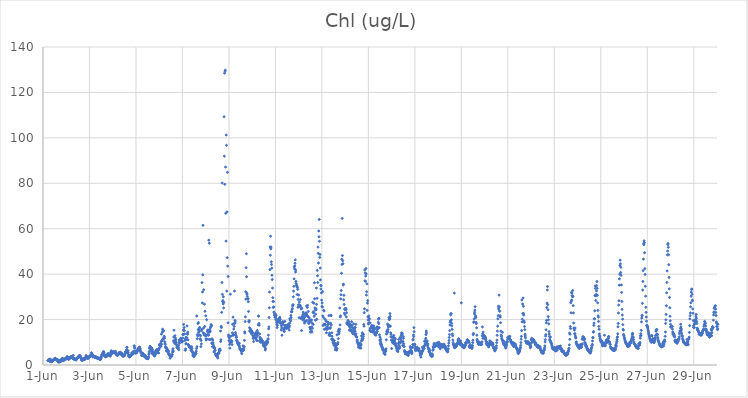
| Category | Chl (ug/L) |
|---|---|
| 44348.208333333336 | 1.96 |
| 44348.21875 | 1.93 |
| 44348.229166666664 | 2.07 |
| 44348.239583333336 | 1.94 |
| 44348.25 | 1.93 |
| 44348.260416666664 | 2.61 |
| 44348.270833333336 | 1.78 |
| 44348.28125 | 1.86 |
| 44348.291666666664 | 1.71 |
| 44348.302083333336 | 1.68 |
| 44348.3125 | 1.9 |
| 44348.322916666664 | 2.53 |
| 44348.333333333336 | 1.59 |
| 44348.34375 | 1.69 |
| 44348.354166666664 | 1.73 |
| 44348.364583333336 | 1.57 |
| 44348.375 | 1.46 |
| 44348.385416666664 | 1.53 |
| 44348.395833333336 | 1.7 |
| 44348.40625 | 1.76 |
| 44348.416666666664 | 1.79 |
| 44348.427083333336 | 1.91 |
| 44348.4375 | 2.16 |
| 44348.447916666664 | 2.2 |
| 44348.458333333336 | 2.27 |
| 44348.46875 | 2.54 |
| 44348.479166666664 | 2.6 |
| 44348.489583333336 | 2.59 |
| 44348.5 | 2.6 |
| 44348.510416666664 | 2.67 |
| 44348.520833333336 | 2.82 |
| 44348.53125 | 2.98 |
| 44348.541666666664 | 2.52 |
| 44348.552083333336 | 2.63 |
| 44348.5625 | 2.37 |
| 44348.572916666664 | 2.26 |
| 44348.583333333336 | 2.15 |
| 44348.59375 | 2.37 |
| 44348.604166666664 | 2.31 |
| 44348.614583333336 | 1.94 |
| 44348.625 | 2.42 |
| 44348.635416666664 | 1.95 |
| 44348.645833333336 | 1.94 |
| 44348.65625 | 1.31 |
| 44348.666666666664 | 1.36 |
| 44348.677083333336 | 1.84 |
| 44348.6875 | 1.83 |
| 44348.697916666664 | 1.46 |
| 44348.708333333336 | 1.4 |
| 44348.71875 | 1.34 |
| 44348.729166666664 | 2.06 |
| 44348.739583333336 | 1.53 |
| 44348.75 | 1.81 |
| 44348.760416666664 | 1.57 |
| 44348.770833333336 | 2.18 |
| 44348.78125 | 2.31 |
| 44348.791666666664 | 1.9 |
| 44348.802083333336 | 2.48 |
| 44348.8125 | 2.7 |
| 44348.822916666664 | 2.13 |
| 44348.833333333336 | 2.87 |
| 44348.84375 | 2.91 |
| 44348.854166666664 | 2.19 |
| 44348.864583333336 | 2.61 |
| 44348.875 | 2.01 |
| 44348.885416666664 | 2.13 |
| 44348.895833333336 | 2.11 |
| 44348.90625 | 2.2 |
| 44348.916666666664 | 2.36 |
| 44348.927083333336 | 2.61 |
| 44348.9375 | 2.63 |
| 44348.947916666664 | 2.58 |
| 44348.958333333336 | 2.64 |
| 44348.96875 | 2.7 |
| 44348.979166666664 | 2.63 |
| 44348.989583333336 | 2.73 |
| 44349.0 | 2.76 |
| 44349.010416666664 | 2.78 |
| 44349.020833333336 | 2.93 |
| 44349.03125 | 3.55 |
| 44349.041666666664 | 3.67 |
| 44349.052083333336 | 3.5 |
| 44349.0625 | 3.17 |
| 44349.072916666664 | 3.05 |
| 44349.083333333336 | 2.74 |
| 44349.09375 | 2.45 |
| 44349.104166666664 | 2.76 |
| 44349.114583333336 | 3.03 |
| 44349.125 | 2.93 |
| 44349.135416666664 | 2.79 |
| 44349.145833333336 | 3.24 |
| 44349.15625 | 2.96 |
| 44349.166666666664 | 3.1 |
| 44349.177083333336 | 3.44 |
| 44349.1875 | 3.38 |
| 44349.197916666664 | 3.59 |
| 44349.208333333336 | 3.63 |
| 44349.21875 | 3.52 |
| 44349.229166666664 | 3.71 |
| 44349.239583333336 | 3.4 |
| 44349.25 | 3.38 |
| 44349.260416666664 | 3.02 |
| 44349.270833333336 | 3 |
| 44349.28125 | 3.22 |
| 44349.291666666664 | 2.79 |
| 44349.302083333336 | 4.26 |
| 44349.3125 | 2.68 |
| 44349.322916666664 | 2.86 |
| 44349.333333333336 | 2.99 |
| 44349.34375 | 2.76 |
| 44349.354166666664 | 2.41 |
| 44349.364583333336 | 2.48 |
| 44349.375 | 2.34 |
| 44349.385416666664 | 2.72 |
| 44349.395833333336 | 2.37 |
| 44349.40625 | 2.35 |
| 44349.416666666664 | 2.24 |
| 44349.427083333336 | 2.26 |
| 44349.4375 | 2.51 |
| 44349.447916666664 | 2.71 |
| 44349.458333333336 | 2.89 |
| 44349.46875 | 3.06 |
| 44349.479166666664 | 3.01 |
| 44349.489583333336 | 3.19 |
| 44349.5 | 3.44 |
| 44349.510416666664 | 3.29 |
| 44349.520833333336 | 3.39 |
| 44349.53125 | 3.58 |
| 44349.541666666664 | 3.77 |
| 44349.552083333336 | 3.9 |
| 44349.5625 | 4.17 |
| 44349.572916666664 | 4 |
| 44349.583333333336 | 4.14 |
| 44349.59375 | 4.04 |
| 44349.604166666664 | 3.93 |
| 44349.614583333336 | 3.36 |
| 44349.625 | 3.32 |
| 44349.635416666664 | 2.84 |
| 44349.645833333336 | 2.73 |
| 44349.65625 | 2.26 |
| 44349.666666666664 | 2.16 |
| 44349.677083333336 | 2.01 |
| 44349.6875 | 2.41 |
| 44349.697916666664 | 2.23 |
| 44349.708333333336 | 2.37 |
| 44349.71875 | 2.66 |
| 44349.729166666664 | 2.76 |
| 44349.739583333336 | 2.3 |
| 44349.75 | 2.49 |
| 44349.760416666664 | 2.7 |
| 44349.770833333336 | 2.66 |
| 44349.78125 | 2.72 |
| 44349.791666666664 | 2.96 |
| 44349.802083333336 | 2.43 |
| 44349.8125 | 2.91 |
| 44349.822916666664 | 2.88 |
| 44349.833333333336 | 3.37 |
| 44349.84375 | 3.35 |
| 44349.854166666664 | 4.21 |
| 44349.864583333336 | 3.57 |
| 44349.875 | 3.59 |
| 44349.885416666664 | 3.69 |
| 44349.895833333336 | 2.93 |
| 44349.90625 | 3.58 |
| 44349.916666666664 | 3.06 |
| 44349.927083333336 | 3.03 |
| 44349.9375 | 3.09 |
| 44349.947916666664 | 3.05 |
| 44349.958333333336 | 3.05 |
| 44349.96875 | 3.17 |
| 44349.979166666664 | 3.39 |
| 44349.989583333336 | 3.69 |
| 44350.0 | 3.71 |
| 44350.010416666664 | 3.8 |
| 44350.020833333336 | 4.07 |
| 44350.03125 | 4.06 |
| 44350.041666666664 | 3.96 |
| 44350.052083333336 | 4.18 |
| 44350.0625 | 4.14 |
| 44350.072916666664 | 4.14 |
| 44350.083333333336 | 5.41 |
| 44350.09375 | 4.54 |
| 44350.104166666664 | 4.91 |
| 44350.114583333336 | 4.54 |
| 44350.125 | 4.47 |
| 44350.135416666664 | 3.64 |
| 44350.145833333336 | 3.72 |
| 44350.15625 | 3.63 |
| 44350.166666666664 | 3.92 |
| 44350.177083333336 | 3.7 |
| 44350.1875 | 3.74 |
| 44350.197916666664 | 3.67 |
| 44350.208333333336 | 3.82 |
| 44350.21875 | 3.5 |
| 44350.229166666664 | 3.68 |
| 44350.239583333336 | 3.21 |
| 44350.25 | 3.28 |
| 44350.260416666664 | 3.57 |
| 44350.270833333336 | 3.4 |
| 44350.28125 | 3.67 |
| 44350.291666666664 | 3.41 |
| 44350.302083333336 | 3.27 |
| 44350.3125 | 3.15 |
| 44350.322916666664 | 3.24 |
| 44350.333333333336 | 3.05 |
| 44350.34375 | 3.11 |
| 44350.354166666664 | 3.17 |
| 44350.364583333336 | 2.71 |
| 44350.375 | 2.88 |
| 44350.385416666664 | 3.12 |
| 44350.395833333336 | 2.97 |
| 44350.40625 | 2.85 |
| 44350.416666666664 | 3.01 |
| 44350.427083333336 | 2.67 |
| 44350.4375 | 2.6 |
| 44350.447916666664 | 2.59 |
| 44350.458333333336 | 2.31 |
| 44350.46875 | 2.48 |
| 44350.479166666664 | 2.53 |
| 44350.489583333336 | 2.84 |
| 44350.5 | 3.1 |
| 44350.510416666664 | 3.51 |
| 44350.520833333336 | 4.01 |
| 44350.53125 | 4.52 |
| 44350.541666666664 | 4.69 |
| 44350.552083333336 | 4.81 |
| 44350.5625 | 5 |
| 44350.572916666664 | 5.16 |
| 44350.583333333336 | 5.48 |
| 44350.59375 | 5.31 |
| 44350.604166666664 | 5.95 |
| 44350.614583333336 | 5.47 |
| 44350.625 | 5.24 |
| 44350.635416666664 | 4.62 |
| 44350.645833333336 | 4.03 |
| 44350.65625 | 4.01 |
| 44350.666666666664 | 4.13 |
| 44350.677083333336 | 3.85 |
| 44350.6875 | 3.93 |
| 44350.697916666664 | 3.64 |
| 44350.708333333336 | 3.61 |
| 44350.71875 | 3.81 |
| 44350.729166666664 | 3.77 |
| 44350.739583333336 | 3.78 |
| 44350.75 | 4.06 |
| 44350.760416666664 | 4.17 |
| 44350.770833333336 | 4.66 |
| 44350.78125 | 4.66 |
| 44350.791666666664 | 4.8 |
| 44350.802083333336 | 5.08 |
| 44350.8125 | 4.54 |
| 44350.822916666664 | 4.35 |
| 44350.833333333336 | 4.39 |
| 44350.84375 | 4.42 |
| 44350.854166666664 | 4.68 |
| 44350.864583333336 | 4.7 |
| 44350.875 | 4.72 |
| 44350.885416666664 | 3.91 |
| 44350.895833333336 | 3.98 |
| 44350.90625 | 4.31 |
| 44350.916666666664 | 5.35 |
| 44350.927083333336 | 5.79 |
| 44350.9375 | 6.26 |
| 44350.947916666664 | 5.61 |
| 44350.958333333336 | 5.1 |
| 44350.96875 | 5.19 |
| 44350.979166666664 | 5.56 |
| 44350.989583333336 | 5.3 |
| 44351.0 | 5.2 |
| 44351.010416666664 | 5.44 |
| 44351.020833333336 | 5.64 |
| 44351.03125 | 5.93 |
| 44351.041666666664 | 5.94 |
| 44351.052083333336 | 5.72 |
| 44351.0625 | 5.68 |
| 44351.072916666664 | 5.46 |
| 44351.083333333336 | 5.32 |
| 44351.09375 | 5.48 |
| 44351.104166666664 | 5.31 |
| 44351.114583333336 | 5.22 |
| 44351.125 | 5.99 |
| 44351.135416666664 | 5.33 |
| 44351.145833333336 | 5.09 |
| 44351.15625 | 4.74 |
| 44351.166666666664 | 4.41 |
| 44351.177083333336 | 4.62 |
| 44351.1875 | 4.6 |
| 44351.197916666664 | 4.38 |
| 44351.208333333336 | 4.24 |
| 44351.21875 | 4.53 |
| 44351.229166666664 | 4.64 |
| 44351.239583333336 | 4.54 |
| 44351.25 | 4.96 |
| 44351.260416666664 | 4.79 |
| 44351.270833333336 | 5.3 |
| 44351.28125 | 5.5 |
| 44351.291666666664 | 5.22 |
| 44351.302083333336 | 5.31 |
| 44351.3125 | 5.3 |
| 44351.322916666664 | 5.64 |
| 44351.333333333336 | 4.75 |
| 44351.34375 | 5.12 |
| 44351.354166666664 | 5.37 |
| 44351.364583333336 | 4.91 |
| 44351.375 | 5.22 |
| 44351.385416666664 | 5.07 |
| 44351.395833333336 | 5 |
| 44351.40625 | 4.42 |
| 44351.416666666664 | 4.59 |
| 44351.427083333336 | 3.88 |
| 44351.4375 | 4.19 |
| 44351.447916666664 | 4.09 |
| 44351.458333333336 | 3.91 |
| 44351.46875 | 4.15 |
| 44351.479166666664 | 4.01 |
| 44351.489583333336 | 4 |
| 44351.5 | 4.33 |
| 44351.510416666664 | 4.28 |
| 44351.520833333336 | 4.58 |
| 44351.53125 | 5.01 |
| 44351.541666666664 | 5.37 |
| 44351.552083333336 | 5.85 |
| 44351.5625 | 5.92 |
| 44351.572916666664 | 5.71 |
| 44351.583333333336 | 5.7 |
| 44351.59375 | 6.7 |
| 44351.604166666664 | 7.75 |
| 44351.614583333336 | 7.74 |
| 44351.625 | 6.35 |
| 44351.635416666664 | 5.32 |
| 44351.645833333336 | 5.98 |
| 44351.65625 | 6.34 |
| 44351.666666666664 | 5.44 |
| 44351.677083333336 | 4.38 |
| 44351.6875 | 3.78 |
| 44351.697916666664 | 4.44 |
| 44351.708333333336 | 3.84 |
| 44351.71875 | 3.95 |
| 44351.729166666664 | 3.48 |
| 44351.739583333336 | 3.79 |
| 44351.75 | 4.16 |
| 44351.760416666664 | 3.9 |
| 44351.770833333336 | 4.16 |
| 44351.78125 | 4.08 |
| 44351.791666666664 | 4.31 |
| 44351.802083333336 | 4.5 |
| 44351.8125 | 4.67 |
| 44351.822916666664 | 5.26 |
| 44351.833333333336 | 5.43 |
| 44351.84375 | 5.14 |
| 44351.854166666664 | 5.39 |
| 44351.864583333336 | 4.96 |
| 44351.875 | 4.87 |
| 44351.885416666664 | 5.25 |
| 44351.895833333336 | 6.04 |
| 44351.90625 | 5.61 |
| 44351.916666666664 | 5.53 |
| 44351.927083333336 | 8.5 |
| 44351.9375 | 7.85 |
| 44351.947916666664 | 7.4 |
| 44351.958333333336 | 5.22 |
| 44351.96875 | 6.16 |
| 44351.979166666664 | 5.73 |
| 44351.989583333336 | 5.84 |
| 44352.0 | 5.16 |
| 44352.010416666664 | 5.83 |
| 44352.020833333336 | 5.52 |
| 44352.03125 | 5.58 |
| 44352.041666666664 | 5.77 |
| 44352.052083333336 | 6.32 |
| 44352.0625 | 6.32 |
| 44352.072916666664 | 6.53 |
| 44352.083333333336 | 7.01 |
| 44352.09375 | 6.68 |
| 44352.104166666664 | 7.12 |
| 44352.114583333336 | 7.57 |
| 44352.125 | 7.53 |
| 44352.135416666664 | 7.09 |
| 44352.145833333336 | 7.17 |
| 44352.15625 | 6.69 |
| 44352.166666666664 | 7.91 |
| 44352.177083333336 | 6.09 |
| 44352.1875 | 7.08 |
| 44352.197916666664 | 5.91 |
| 44352.208333333336 | 5.99 |
| 44352.21875 | 5.2 |
| 44352.229166666664 | 5.28 |
| 44352.239583333336 | 4.19 |
| 44352.25 | 5.27 |
| 44352.260416666664 | 4.2 |
| 44352.270833333336 | 4.39 |
| 44352.28125 | 5.02 |
| 44352.291666666664 | 5.13 |
| 44352.302083333336 | 4.97 |
| 44352.3125 | 4.67 |
| 44352.322916666664 | 4.41 |
| 44352.333333333336 | 4.56 |
| 44352.34375 | 4.19 |
| 44352.354166666664 | 4.16 |
| 44352.364583333336 | 3.66 |
| 44352.375 | 4.28 |
| 44352.385416666664 | 3.89 |
| 44352.395833333336 | 4.27 |
| 44352.40625 | 3.9 |
| 44352.416666666664 | 3.82 |
| 44352.427083333336 | 3.13 |
| 44352.4375 | 3.17 |
| 44352.447916666664 | 2.92 |
| 44352.458333333336 | 2.9 |
| 44352.46875 | 2.93 |
| 44352.479166666664 | 3.24 |
| 44352.489583333336 | 2.98 |
| 44352.5 | 2.94 |
| 44352.510416666664 | 2.73 |
| 44352.520833333336 | 2.85 |
| 44352.53125 | 3.22 |
| 44352.541666666664 | 3.61 |
| 44352.552083333336 | 4.63 |
| 44352.5625 | 5.24 |
| 44352.572916666664 | 5.98 |
| 44352.583333333336 | 7.28 |
| 44352.59375 | 7.56 |
| 44352.604166666664 | 8.24 |
| 44352.614583333336 | 7.9 |
| 44352.625 | 7.37 |
| 44352.635416666664 | 6.02 |
| 44352.645833333336 | 7.71 |
| 44352.65625 | 7.69 |
| 44352.666666666664 | 7.44 |
| 44352.677083333336 | 6.84 |
| 44352.6875 | 5.14 |
| 44352.697916666664 | 6.43 |
| 44352.708333333336 | 6.92 |
| 44352.71875 | 5.24 |
| 44352.729166666664 | 4.98 |
| 44352.739583333336 | 5.7 |
| 44352.75 | 5.16 |
| 44352.760416666664 | 5.31 |
| 44352.770833333336 | 4.28 |
| 44352.78125 | 4.53 |
| 44352.791666666664 | 4.17 |
| 44352.802083333336 | 4.03 |
| 44352.8125 | 3.98 |
| 44352.822916666664 | 4.63 |
| 44352.833333333336 | 4.59 |
| 44352.84375 | 5.96 |
| 44352.854166666664 | 5.88 |
| 44352.864583333336 | 6.25 |
| 44352.875 | 5.33 |
| 44352.885416666664 | 6.71 |
| 44352.895833333336 | 6.78 |
| 44352.90625 | 6.37 |
| 44352.916666666664 | 6.45 |
| 44352.927083333336 | 5.43 |
| 44352.9375 | 6.61 |
| 44352.947916666664 | 6.3 |
| 44352.958333333336 | 6.37 |
| 44352.96875 | 6.64 |
| 44352.979166666664 | 5.31 |
| 44352.989583333336 | 6.99 |
| 44353.0 | 7.36 |
| 44353.010416666664 | 8.61 |
| 44353.020833333336 | 8.97 |
| 44353.03125 | 9.23 |
| 44353.041666666664 | 9.15 |
| 44353.052083333336 | 8.21 |
| 44353.0625 | 8.89 |
| 44353.072916666664 | 8.18 |
| 44353.083333333336 | 10.17 |
| 44353.09375 | 13.6 |
| 44353.104166666664 | 9.1 |
| 44353.114583333336 | 10.81 |
| 44353.125 | 10.83 |
| 44353.135416666664 | 14.45 |
| 44353.145833333336 | 15.76 |
| 44353.15625 | 11.41 |
| 44353.166666666664 | 15.26 |
| 44353.177083333336 | 15.04 |
| 44353.1875 | 15.09 |
| 44353.197916666664 | 11.75 |
| 44353.208333333336 | 12.29 |
| 44353.21875 | 12.65 |
| 44353.229166666664 | 11.74 |
| 44353.239583333336 | 10.25 |
| 44353.25 | 9.56 |
| 44353.260416666664 | 9.05 |
| 44353.270833333336 | 7.85 |
| 44353.28125 | 8.07 |
| 44353.291666666664 | 7.54 |
| 44353.302083333336 | 7.4 |
| 44353.3125 | 6.1 |
| 44353.322916666664 | 6.51 |
| 44353.333333333336 | 7.32 |
| 44353.34375 | 6.63 |
| 44353.354166666664 | 6.29 |
| 44353.364583333336 | 6.47 |
| 44353.375 | 6.27 |
| 44353.385416666664 | 5.61 |
| 44353.395833333336 | 6.08 |
| 44353.40625 | 4.9 |
| 44353.416666666664 | 4.95 |
| 44353.427083333336 | 4.58 |
| 44353.4375 | 4.46 |
| 44353.447916666664 | 4.27 |
| 44353.458333333336 | 3.93 |
| 44353.46875 | 2.96 |
| 44353.479166666664 | 4.01 |
| 44353.489583333336 | 4.42 |
| 44353.5 | 3.92 |
| 44353.510416666664 | 3.98 |
| 44353.520833333336 | 4.22 |
| 44353.53125 | 3.95 |
| 44353.541666666664 | 3.86 |
| 44353.552083333336 | 4.42 |
| 44353.5625 | 4.65 |
| 44353.572916666664 | 5.69 |
| 44353.583333333336 | 6.56 |
| 44353.59375 | 7.14 |
| 44353.604166666664 | 6.06 |
| 44353.614583333336 | 10.66 |
| 44353.625 | 12.36 |
| 44353.635416666664 | 15.32 |
| 44353.645833333336 | 9.88 |
| 44353.65625 | 10.62 |
| 44353.666666666664 | 10.09 |
| 44353.677083333336 | 12.93 |
| 44353.6875 | 9.39 |
| 44353.697916666664 | 11.87 |
| 44353.708333333336 | 11.12 |
| 44353.71875 | 10.95 |
| 44353.729166666664 | 9.93 |
| 44353.739583333336 | 9.15 |
| 44353.75 | 8.84 |
| 44353.760416666664 | 7.65 |
| 44353.770833333336 | 7.99 |
| 44353.78125 | 7.6 |
| 44353.791666666664 | 7.84 |
| 44353.802083333336 | 7.42 |
| 44353.8125 | 7.22 |
| 44353.822916666664 | 7.72 |
| 44353.833333333336 | 8.54 |
| 44353.84375 | 6.7 |
| 44353.854166666664 | 10.08 |
| 44353.864583333336 | 11.02 |
| 44353.875 | 9.54 |
| 44353.885416666664 | 11.03 |
| 44353.895833333336 | 11.11 |
| 44353.90625 | 10.76 |
| 44353.916666666664 | 11.31 |
| 44353.927083333336 | 11.75 |
| 44353.9375 | 10.98 |
| 44353.947916666664 | 11 |
| 44353.958333333336 | 10.75 |
| 44353.96875 | 10.23 |
| 44353.979166666664 | 10.39 |
| 44353.989583333336 | 10.14 |
| 44354.0 | 10.5 |
| 44354.010416666664 | 11.89 |
| 44354.020833333336 | 13.34 |
| 44354.03125 | 13.53 |
| 44354.041666666664 | 15.3 |
| 44354.052083333336 | 17.88 |
| 44354.0625 | 15.37 |
| 44354.072916666664 | 16.48 |
| 44354.083333333336 | 15.15 |
| 44354.09375 | 13.65 |
| 44354.104166666664 | 10.79 |
| 44354.114583333336 | 11.48 |
| 44354.125 | 6.45 |
| 44354.135416666664 | 7.11 |
| 44354.145833333336 | 9.27 |
| 44354.15625 | 12.21 |
| 44354.166666666664 | 9.44 |
| 44354.177083333336 | 11.18 |
| 44354.1875 | 11.99 |
| 44354.197916666664 | 17.19 |
| 44354.208333333336 | 13.83 |
| 44354.21875 | 13.51 |
| 44354.229166666664 | 14.5 |
| 44354.239583333336 | 11.08 |
| 44354.25 | 9 |
| 44354.260416666664 | 8.59 |
| 44354.270833333336 | 8.56 |
| 44354.28125 | 8.35 |
| 44354.291666666664 | 7.88 |
| 44354.302083333336 | 7.96 |
| 44354.3125 | 7.89 |
| 44354.322916666664 | 8.1 |
| 44354.333333333336 | 7.87 |
| 44354.34375 | 7.71 |
| 44354.354166666664 | 7.57 |
| 44354.364583333336 | 6.39 |
| 44354.375 | 6.97 |
| 44354.385416666664 | 7.67 |
| 44354.395833333336 | 8.05 |
| 44354.40625 | 7.26 |
| 44354.416666666664 | 6.11 |
| 44354.427083333336 | 5.79 |
| 44354.4375 | 5.33 |
| 44354.447916666664 | 4.12 |
| 44354.458333333336 | 4.4 |
| 44354.46875 | 5.29 |
| 44354.479166666664 | 4.32 |
| 44354.489583333336 | 3.67 |
| 44354.5 | 4.55 |
| 44354.510416666664 | 4.35 |
| 44354.520833333336 | 4.4 |
| 44354.53125 | 4.34 |
| 44354.541666666664 | 4.41 |
| 44354.552083333336 | 5.13 |
| 44354.5625 | 5.5 |
| 44354.572916666664 | 4.91 |
| 44354.583333333336 | 5.06 |
| 44354.59375 | 6.1 |
| 44354.604166666664 | 7.25 |
| 44354.614583333336 | 21.59 |
| 44354.625 | 8.06 |
| 44354.635416666664 | 11.58 |
| 44354.645833333336 | 13.39 |
| 44354.65625 | 12.81 |
| 44354.666666666664 | 18.28 |
| 44354.677083333336 | 15.6 |
| 44354.6875 | 18.68 |
| 44354.697916666664 | 14.32 |
| 44354.708333333336 | 15.42 |
| 44354.71875 | 14.81 |
| 44354.729166666664 | 16.14 |
| 44354.739583333336 | 16.55 |
| 44354.75 | 13.22 |
| 44354.760416666664 | 11.57 |
| 44354.770833333336 | 11.32 |
| 44354.78125 | 12.88 |
| 44354.791666666664 | 8.1 |
| 44354.802083333336 | 10.8 |
| 44354.8125 | 9.31 |
| 44354.822916666664 | 15.08 |
| 44354.833333333336 | 15.69 |
| 44354.84375 | 36.27 |
| 44354.854166666664 | 27.34 |
| 44354.864583333336 | 32.16 |
| 44354.875 | 39.71 |
| 44354.885416666664 | 61.5 |
| 44354.895833333336 | 14.14 |
| 44354.90625 | 16.23 |
| 44354.916666666664 | 33.12 |
| 44354.927083333336 | 13.27 |
| 44354.9375 | 13.74 |
| 44354.947916666664 | 26.77 |
| 44354.958333333336 | 16.96 |
| 44354.96875 | 23.63 |
| 44354.979166666664 | 13.43 |
| 44354.989583333336 | 12.82 |
| 44355.0 | 21.69 |
| 44355.010416666664 | 11.49 |
| 44355.020833333336 | 11 |
| 44355.03125 | 12.95 |
| 44355.041666666664 | 19.94 |
| 44355.052083333336 | 11.5 |
| 44355.0625 | 13.32 |
| 44355.072916666664 | 14.77 |
| 44355.083333333336 | 15.39 |
| 44355.09375 | 14.66 |
| 44355.104166666664 | 14.66 |
| 44355.114583333336 | 13.58 |
| 44355.125 | 13.08 |
| 44355.135416666664 | 54.95 |
| 44355.145833333336 | 11.25 |
| 44355.15625 | 53.6 |
| 44355.166666666664 | 15.66 |
| 44355.177083333336 | 14.48 |
| 44355.1875 | 11.21 |
| 44355.197916666664 | 14.97 |
| 44355.208333333336 | 16.46 |
| 44355.21875 | 16.8 |
| 44355.229166666664 | 17.7 |
| 44355.239583333336 | 17.56 |
| 44355.25 | 17.32 |
| 44355.260416666664 | 9.7 |
| 44355.270833333336 | 11.56 |
| 44355.28125 | 9.43 |
| 44355.291666666664 | 8.04 |
| 44355.302083333336 | 10.99 |
| 44355.3125 | 9.85 |
| 44355.322916666664 | 9.18 |
| 44355.333333333336 | 8.19 |
| 44355.34375 | 8.19 |
| 44355.354166666664 | 5.75 |
| 44355.364583333336 | 7.46 |
| 44355.375 | 7.37 |
| 44355.385416666664 | 7.52 |
| 44355.395833333336 | 6.29 |
| 44355.40625 | 6.53 |
| 44355.416666666664 | 4.75 |
| 44355.427083333336 | 4.77 |
| 44355.4375 | 4.84 |
| 44355.447916666664 | 4.23 |
| 44355.458333333336 | 4.16 |
| 44355.46875 | 3.94 |
| 44355.479166666664 | 4.29 |
| 44355.489583333336 | 3.77 |
| 44355.5 | 4.47 |
| 44355.510416666664 | 3.68 |
| 44355.520833333336 | 3.05 |
| 44355.53125 | 4.99 |
| 44355.541666666664 | 4.9 |
| 44355.552083333336 | 5.48 |
| 44355.5625 | 5.32 |
| 44355.572916666664 | 5.21 |
| 44355.583333333336 | 6.68 |
| 44355.59375 | 6.77 |
| 44355.604166666664 | 6.32 |
| 44355.614583333336 | 7.07 |
| 44355.625 | 6.56 |
| 44355.635416666664 | 14.96 |
| 44355.645833333336 | 10.34 |
| 44355.65625 | 11.08 |
| 44355.666666666664 | 17.05 |
| 44355.677083333336 | 16.5 |
| 44355.6875 | 23.15 |
| 44355.697916666664 | 36.33 |
| 44355.708333333336 | 80.13 |
| 44355.71875 | 31.11 |
| 44355.729166666664 | 27.95 |
| 44355.739583333336 | 28.38 |
| 44355.75 | 26.87 |
| 44355.760416666664 | 30.04 |
| 44355.770833333336 | 25.13 |
| 44355.78125 | 27.57 |
| 44355.791666666664 | 109.29 |
| 44355.802083333336 | 91.94 |
| 44355.8125 | 128.48 |
| 44355.822916666664 | 79.55 |
| 44355.833333333336 | 129.35 |
| 44355.84375 | 129.81 |
| 44355.854166666664 | 87.15 |
| 44355.864583333336 | 66.81 |
| 44355.875 | 54.55 |
| 44355.885416666664 | 101.24 |
| 44355.895833333336 | 96.7 |
| 44355.90625 | 32.55 |
| 44355.916666666664 | 67.43 |
| 44355.927083333336 | 47.25 |
| 44355.9375 | 84.81 |
| 44355.947916666664 | 43.52 |
| 44355.958333333336 | 18.57 |
| 44355.96875 | 38.96 |
| 44355.979166666664 | 13.18 |
| 44355.989583333336 | 12.4 |
| 44356.0 | 10.77 |
| 44356.010416666664 | 12.67 |
| 44356.020833333336 | 11.92 |
| 44356.03125 | 9.04 |
| 44356.041666666664 | 7.42 |
| 44356.052083333336 | 9.8 |
| 44356.0625 | 31.16 |
| 44356.072916666664 | 10.15 |
| 44356.083333333336 | 12.68 |
| 44356.09375 | 10.77 |
| 44356.104166666664 | 10.67 |
| 44356.114583333336 | 10.33 |
| 44356.125 | 10.28 |
| 44356.135416666664 | 9.03 |
| 44356.145833333336 | 14.19 |
| 44356.15625 | 17.88 |
| 44356.166666666664 | 13.08 |
| 44356.177083333336 | 21.05 |
| 44356.1875 | 13.49 |
| 44356.197916666664 | 13.15 |
| 44356.208333333336 | 15.84 |
| 44356.21875 | 18.22 |
| 44356.229166666664 | 16.97 |
| 44356.239583333336 | 32.53 |
| 44356.25 | 18.34 |
| 44356.260416666664 | 19.62 |
| 44356.270833333336 | 18.94 |
| 44356.28125 | 14.32 |
| 44356.291666666664 | 13.53 |
| 44356.302083333336 | 13.08 |
| 44356.3125 | 12.15 |
| 44356.322916666664 | 12.28 |
| 44356.333333333336 | 10.85 |
| 44356.34375 | 10.94 |
| 44356.354166666664 | 10.49 |
| 44356.364583333336 | 10.05 |
| 44356.375 | 9.69 |
| 44356.385416666664 | 9.32 |
| 44356.395833333336 | 9.53 |
| 44356.40625 | 9.12 |
| 44356.416666666664 | 9.31 |
| 44356.427083333336 | 8.79 |
| 44356.4375 | 8.6 |
| 44356.447916666664 | 9.57 |
| 44356.458333333336 | 7.91 |
| 44356.46875 | 7.34 |
| 44356.479166666664 | 6.94 |
| 44356.489583333336 | 7.14 |
| 44356.5 | 6.98 |
| 44356.510416666664 | 6.92 |
| 44356.520833333336 | 6.21 |
| 44356.53125 | 6.46 |
| 44356.541666666664 | 5.83 |
| 44356.552083333336 | 4.99 |
| 44356.5625 | 6.92 |
| 44356.572916666664 | 6.28 |
| 44356.583333333336 | 6.53 |
| 44356.59375 | 6.36 |
| 44356.604166666664 | 8.44 |
| 44356.614583333336 | 6.74 |
| 44356.625 | 6.52 |
| 44356.635416666664 | 6.69 |
| 44356.645833333336 | 7.52 |
| 44356.65625 | 8.08 |
| 44356.666666666664 | 10.84 |
| 44356.677083333336 | 14.58 |
| 44356.6875 | 14.06 |
| 44356.697916666664 | 19.11 |
| 44356.708333333336 | 21.2 |
| 44356.71875 | 32.26 |
| 44356.729166666664 | 28.99 |
| 44356.739583333336 | 42.82 |
| 44356.75 | 48.98 |
| 44356.760416666664 | 38.86 |
| 44356.770833333336 | 31.68 |
| 44356.78125 | 31.09 |
| 44356.791666666664 | 30.18 |
| 44356.802083333336 | 29.16 |
| 44356.8125 | 29.17 |
| 44356.822916666664 | 29.06 |
| 44356.833333333336 | 27.87 |
| 44356.84375 | 23.58 |
| 44356.854166666664 | 19.22 |
| 44356.864583333336 | 18.91 |
| 44356.875 | 19.54 |
| 44356.885416666664 | 16.43 |
| 44356.895833333336 | 15.07 |
| 44356.90625 | 14.79 |
| 44356.916666666664 | 15.88 |
| 44356.927083333336 | 14.99 |
| 44356.9375 | 15.57 |
| 44356.947916666664 | 14.49 |
| 44356.958333333336 | 14.81 |
| 44356.96875 | 13.76 |
| 44356.979166666664 | 14.98 |
| 44356.989583333336 | 14.51 |
| 44357.0 | 14.49 |
| 44357.010416666664 | 14.33 |
| 44357.020833333336 | 13.94 |
| 44357.03125 | 12.92 |
| 44357.041666666664 | 11.88 |
| 44357.052083333336 | 11.67 |
| 44357.0625 | 10.35 |
| 44357.072916666664 | 12.5 |
| 44357.083333333336 | 12.19 |
| 44357.09375 | 12.68 |
| 44357.104166666664 | 12.95 |
| 44357.114583333336 | 13.05 |
| 44357.125 | 13.68 |
| 44357.135416666664 | 13.75 |
| 44357.145833333336 | 11.67 |
| 44357.15625 | 11.87 |
| 44357.166666666664 | 14.3 |
| 44357.177083333336 | 12.06 |
| 44357.1875 | 13.45 |
| 44357.197916666664 | 10.83 |
| 44357.208333333336 | 10.8 |
| 44357.21875 | 15.22 |
| 44357.229166666664 | 12.88 |
| 44357.239583333336 | 13.91 |
| 44357.25 | 14.27 |
| 44357.260416666664 | 17.66 |
| 44357.270833333336 | 21.55 |
| 44357.28125 | 21.49 |
| 44357.291666666664 | 18.3 |
| 44357.302083333336 | 17.54 |
| 44357.3125 | 10.56 |
| 44357.322916666664 | 13.66 |
| 44357.333333333336 | 12.19 |
| 44357.34375 | 11.57 |
| 44357.354166666664 | 10.03 |
| 44357.364583333336 | 10.85 |
| 44357.375 | 11.63 |
| 44357.385416666664 | 11.46 |
| 44357.395833333336 | 10.63 |
| 44357.40625 | 10.64 |
| 44357.416666666664 | 10.61 |
| 44357.427083333336 | 10.74 |
| 44357.4375 | 10.6 |
| 44357.447916666664 | 9.71 |
| 44357.458333333336 | 9.99 |
| 44357.46875 | 9.65 |
| 44357.479166666664 | 8.76 |
| 44357.489583333336 | 8.6 |
| 44357.5 | 8.4 |
| 44357.510416666664 | 8.92 |
| 44357.520833333336 | 8.73 |
| 44357.53125 | 9.82 |
| 44357.541666666664 | 9.29 |
| 44357.552083333336 | 7.66 |
| 44357.5625 | 6.59 |
| 44357.572916666664 | 7.1 |
| 44357.583333333336 | 8.63 |
| 44357.59375 | 9.09 |
| 44357.604166666664 | 10.1 |
| 44357.614583333336 | 10.32 |
| 44357.625 | 10.14 |
| 44357.635416666664 | 10.33 |
| 44357.645833333336 | 9.55 |
| 44357.65625 | 10.04 |
| 44357.666666666664 | 10.07 |
| 44357.677083333336 | 11.25 |
| 44357.6875 | 11.57 |
| 44357.697916666664 | 13.14 |
| 44357.708333333336 | 15.94 |
| 44357.71875 | 16.78 |
| 44357.729166666664 | 20.91 |
| 44357.739583333336 | 25.21 |
| 44357.75 | 32.13 |
| 44357.760416666664 | 41.99 |
| 44357.770833333336 | 51.97 |
| 44357.78125 | 48.32 |
| 44357.791666666664 | 56.67 |
| 44357.802083333336 | 51.16 |
| 44357.8125 | 51.96 |
| 44357.822916666664 | 45.47 |
| 44357.833333333336 | 44.28 |
| 44357.84375 | 42.65 |
| 44357.854166666664 | 39.53 |
| 44357.864583333336 | 37.61 |
| 44357.875 | 33.86 |
| 44357.885416666664 | 29.64 |
| 44357.895833333336 | 27.9 |
| 44357.90625 | 25.32 |
| 44357.916666666664 | 28 |
| 44357.927083333336 | 25.58 |
| 44357.9375 | 23.33 |
| 44357.947916666664 | 22.99 |
| 44357.958333333336 | 21.98 |
| 44357.96875 | 21.82 |
| 44357.979166666664 | 21.05 |
| 44357.989583333336 | 21.06 |
| 44358.0 | 21.25 |
| 44358.010416666664 | 22.31 |
| 44358.020833333336 | 19.94 |
| 44358.03125 | 21.76 |
| 44358.041666666664 | 20.16 |
| 44358.052083333336 | 18.9 |
| 44358.0625 | 17.9 |
| 44358.072916666664 | 16.5 |
| 44358.083333333336 | 17.43 |
| 44358.09375 | 18.68 |
| 44358.104166666664 | 18.97 |
| 44358.114583333336 | 19.04 |
| 44358.125 | 19.86 |
| 44358.135416666664 | 19.49 |
| 44358.145833333336 | 20.3 |
| 44358.15625 | 19.09 |
| 44358.166666666664 | 20.44 |
| 44358.177083333336 | 19.92 |
| 44358.1875 | 21.04 |
| 44358.197916666664 | 19.17 |
| 44358.208333333336 | 20.16 |
| 44358.21875 | 18.26 |
| 44358.229166666664 | 18.92 |
| 44358.239583333336 | 18.43 |
| 44358.25 | 15.4 |
| 44358.260416666664 | 17.23 |
| 44358.270833333336 | 16.31 |
| 44358.28125 | 13.1 |
| 44358.291666666664 | 18.39 |
| 44358.302083333336 | 18.19 |
| 44358.3125 | 18.99 |
| 44358.322916666664 | 18.69 |
| 44358.333333333336 | 19.02 |
| 44358.34375 | 17.77 |
| 44358.354166666664 | 15.44 |
| 44358.364583333336 | 16.04 |
| 44358.375 | 14.82 |
| 44358.385416666664 | 14.86 |
| 44358.395833333336 | 16.21 |
| 44358.40625 | 19.19 |
| 44358.416666666664 | 17.16 |
| 44358.427083333336 | 17.09 |
| 44358.4375 | 16.3 |
| 44358.447916666664 | 17.36 |
| 44358.458333333336 | 17.41 |
| 44358.46875 | 17.25 |
| 44358.479166666664 | 16.11 |
| 44358.489583333336 | 17.36 |
| 44358.5 | 16.21 |
| 44358.510416666664 | 17.32 |
| 44358.520833333336 | 17.23 |
| 44358.53125 | 16.74 |
| 44358.541666666664 | 17.05 |
| 44358.552083333336 | 17.42 |
| 44358.5625 | 18.03 |
| 44358.572916666664 | 16.51 |
| 44358.583333333336 | 16.6 |
| 44358.59375 | 15.38 |
| 44358.604166666664 | 17.21 |
| 44358.614583333336 | 18.35 |
| 44358.625 | 20.3 |
| 44358.635416666664 | 20.32 |
| 44358.645833333336 | 19.7 |
| 44358.65625 | 19.43 |
| 44358.666666666664 | 21.8 |
| 44358.677083333336 | 20.89 |
| 44358.6875 | 23.52 |
| 44358.697916666664 | 23.45 |
| 44358.708333333336 | 23.44 |
| 44358.71875 | 24.59 |
| 44358.729166666664 | 24.88 |
| 44358.739583333336 | 26.05 |
| 44358.75 | 26.44 |
| 44358.760416666664 | 26.52 |
| 44358.770833333336 | 30.04 |
| 44358.78125 | 32.53 |
| 44358.791666666664 | 34.63 |
| 44358.802083333336 | 37.93 |
| 44358.8125 | 43.22 |
| 44358.822916666664 | 42.29 |
| 44358.833333333336 | 43.6 |
| 44358.84375 | 44.76 |
| 44358.854166666664 | 46.31 |
| 44358.864583333336 | 40.92 |
| 44358.875 | 41.87 |
| 44358.885416666664 | 36.8 |
| 44358.895833333336 | 35.85 |
| 44358.90625 | 35.08 |
| 44358.916666666664 | 35 |
| 44358.927083333336 | 34.54 |
| 44358.9375 | 31.04 |
| 44358.947916666664 | 34.11 |
| 44358.958333333336 | 33.29 |
| 44358.96875 | 25.4 |
| 44358.979166666664 | 28.84 |
| 44358.989583333336 | 26.51 |
| 44359.0 | 30.82 |
| 44359.010416666664 | 25.66 |
| 44359.020833333336 | 20.83 |
| 44359.03125 | 27.65 |
| 44359.041666666664 | 26.3 |
| 44359.052083333336 | 25.98 |
| 44359.0625 | 26.2 |
| 44359.072916666664 | 28.79 |
| 44359.083333333336 | 20.55 |
| 44359.09375 | 25.54 |
| 44359.104166666664 | 24.66 |
| 44359.114583333336 | 20.66 |
| 44359.125 | 15.14 |
| 44359.135416666664 | 24.93 |
| 44359.145833333336 | 21.32 |
| 44359.15625 | 21.06 |
| 44359.166666666664 | 20.5 |
| 44359.177083333336 | 19.84 |
| 44359.1875 | 22.27 |
| 44359.197916666664 | 23.24 |
| 44359.208333333336 | 20.92 |
| 44359.21875 | 22.33 |
| 44359.229166666664 | 20.24 |
| 44359.239583333336 | 21.12 |
| 44359.25 | 18.48 |
| 44359.260416666664 | 19.17 |
| 44359.270833333336 | 21.14 |
| 44359.28125 | 22.15 |
| 44359.291666666664 | 22.53 |
| 44359.302083333336 | 19.17 |
| 44359.3125 | 22.06 |
| 44359.322916666664 | 22.99 |
| 44359.333333333336 | 22.62 |
| 44359.34375 | 25.97 |
| 44359.354166666664 | 19.63 |
| 44359.364583333336 | 21.79 |
| 44359.375 | 25.33 |
| 44359.385416666664 | 26.25 |
| 44359.395833333336 | 21.27 |
| 44359.40625 | 21.27 |
| 44359.416666666664 | 23.59 |
| 44359.427083333336 | 18.75 |
| 44359.4375 | 18.25 |
| 44359.447916666664 | 18.59 |
| 44359.458333333336 | 20.71 |
| 44359.46875 | 19.83 |
| 44359.479166666664 | 16.6 |
| 44359.489583333336 | 19.46 |
| 44359.5 | 15.82 |
| 44359.510416666664 | 14.53 |
| 44359.520833333336 | 19.19 |
| 44359.53125 | 16.37 |
| 44359.541666666664 | 15.04 |
| 44359.552083333336 | 19.86 |
| 44359.5625 | 16.78 |
| 44359.572916666664 | 14.49 |
| 44359.583333333336 | 18.4 |
| 44359.59375 | 16.19 |
| 44359.604166666664 | 27.61 |
| 44359.614583333336 | 23.27 |
| 44359.625 | 17.86 |
| 44359.635416666664 | 23.33 |
| 44359.645833333336 | 22.92 |
| 44359.65625 | 27.19 |
| 44359.666666666664 | 21.43 |
| 44359.677083333336 | 36.22 |
| 44359.6875 | 29.17 |
| 44359.697916666664 | 25.07 |
| 44359.708333333336 | 24.17 |
| 44359.71875 | 19.72 |
| 44359.729166666664 | 22.34 |
| 44359.739583333336 | 24.87 |
| 44359.75 | 24.37 |
| 44359.760416666664 | 33.88 |
| 44359.770833333336 | 26.69 |
| 44359.78125 | 20.11 |
| 44359.791666666664 | 29.37 |
| 44359.802083333336 | 41.63 |
| 44359.8125 | 39.31 |
| 44359.822916666664 | 36.29 |
| 44359.833333333336 | 51.91 |
| 44359.84375 | 49.18 |
| 44359.854166666664 | 44.91 |
| 44359.864583333336 | 59 |
| 44359.875 | 56.47 |
| 44359.885416666664 | 64.1 |
| 44359.895833333336 | 54.47 |
| 44359.90625 | 47.37 |
| 44359.916666666664 | 48.68 |
| 44359.927083333336 | 42.69 |
| 44359.9375 | 37.46 |
| 44359.947916666664 | 35.05 |
| 44359.958333333336 | 33.46 |
| 44359.96875 | 34.94 |
| 44359.979166666664 | 31.77 |
| 44359.989583333336 | 28.57 |
| 44360.0 | 25.77 |
| 44360.010416666664 | 27.29 |
| 44360.020833333336 | 25.51 |
| 44360.03125 | 32.34 |
| 44360.041666666664 | 21.6 |
| 44360.052083333336 | 17.41 |
| 44360.0625 | 20.97 |
| 44360.072916666664 | 24.08 |
| 44360.083333333336 | 17.98 |
| 44360.09375 | 23.78 |
| 44360.104166666664 | 15.73 |
| 44360.114583333336 | 17.71 |
| 44360.125 | 17.94 |
| 44360.135416666664 | 20.17 |
| 44360.145833333336 | 17.57 |
| 44360.15625 | 15.9 |
| 44360.166666666664 | 16 |
| 44360.177083333336 | 19.4 |
| 44360.1875 | 19.2 |
| 44360.197916666664 | 14.19 |
| 44360.208333333336 | 15.75 |
| 44360.21875 | 15.76 |
| 44360.229166666664 | 16.72 |
| 44360.239583333336 | 15.89 |
| 44360.25 | 17.87 |
| 44360.260416666664 | 18.74 |
| 44360.270833333336 | 18.71 |
| 44360.28125 | 17.93 |
| 44360.291666666664 | 16.17 |
| 44360.302083333336 | 21.76 |
| 44360.3125 | 13.09 |
| 44360.322916666664 | 13.53 |
| 44360.333333333336 | 14.1 |
| 44360.34375 | 12.95 |
| 44360.354166666664 | 16.12 |
| 44360.364583333336 | 16.52 |
| 44360.375 | 18.4 |
| 44360.385416666664 | 21.94 |
| 44360.395833333336 | 21.73 |
| 44360.40625 | 17.65 |
| 44360.416666666664 | 11.38 |
| 44360.427083333336 | 14.18 |
| 44360.4375 | 12.67 |
| 44360.447916666664 | 11.09 |
| 44360.458333333336 | 11.47 |
| 44360.46875 | 10.92 |
| 44360.479166666664 | 10.53 |
| 44360.489583333336 | 9.96 |
| 44360.5 | 9.33 |
| 44360.510416666664 | 9.58 |
| 44360.520833333336 | 8.66 |
| 44360.53125 | 10.81 |
| 44360.541666666664 | 9.07 |
| 44360.552083333336 | 9.44 |
| 44360.5625 | 9.62 |
| 44360.572916666664 | 6.7 |
| 44360.583333333336 | 7.63 |
| 44360.59375 | 8.66 |
| 44360.604166666664 | 8 |
| 44360.614583333336 | 7.35 |
| 44360.625 | 8.91 |
| 44360.635416666664 | 6.51 |
| 44360.645833333336 | 13.26 |
| 44360.65625 | 7.19 |
| 44360.666666666664 | 9.06 |
| 44360.677083333336 | 9.35 |
| 44360.6875 | 9.9 |
| 44360.697916666664 | 14.81 |
| 44360.708333333336 | 11.62 |
| 44360.71875 | 13.65 |
| 44360.729166666664 | 15.67 |
| 44360.739583333336 | 14.08 |
| 44360.75 | 14.88 |
| 44360.760416666664 | 15.75 |
| 44360.770833333336 | 25.07 |
| 44360.78125 | 17.66 |
| 44360.791666666664 | 21.17 |
| 44360.802083333336 | 21.66 |
| 44360.8125 | 29.12 |
| 44360.822916666664 | 30.93 |
| 44360.833333333336 | 32.81 |
| 44360.84375 | 40.38 |
| 44360.854166666664 | 46.55 |
| 44360.864583333336 | 44.27 |
| 44360.875 | 64.56 |
| 44360.885416666664 | 48.19 |
| 44360.895833333336 | 45.91 |
| 44360.90625 | 44.61 |
| 44360.916666666664 | 35.22 |
| 44360.927083333336 | 35.6 |
| 44360.9375 | 28.72 |
| 44360.947916666664 | 30.67 |
| 44360.958333333336 | 26.68 |
| 44360.96875 | 22.82 |
| 44360.979166666664 | 24.68 |
| 44360.989583333336 | 22.15 |
| 44361.0 | 24.35 |
| 44361.010416666664 | 24.68 |
| 44361.020833333336 | 24.43 |
| 44361.03125 | 24.97 |
| 44361.041666666664 | 24.47 |
| 44361.052083333336 | 21.18 |
| 44361.0625 | 23.07 |
| 44361.072916666664 | 18.14 |
| 44361.083333333336 | 18.59 |
| 44361.09375 | 18.19 |
| 44361.104166666664 | 18.61 |
| 44361.114583333336 | 19 |
| 44361.125 | 19.65 |
| 44361.135416666664 | 17.82 |
| 44361.145833333336 | 17.51 |
| 44361.15625 | 17.52 |
| 44361.166666666664 | 18.86 |
| 44361.177083333336 | 15.33 |
| 44361.1875 | 18.05 |
| 44361.197916666664 | 17.2 |
| 44361.208333333336 | 16.51 |
| 44361.21875 | 17.88 |
| 44361.229166666664 | 17.54 |
| 44361.239583333336 | 15.66 |
| 44361.25 | 15.09 |
| 44361.260416666664 | 15.26 |
| 44361.270833333336 | 15.08 |
| 44361.28125 | 19.02 |
| 44361.291666666664 | 17.38 |
| 44361.302083333336 | 14.44 |
| 44361.3125 | 16.64 |
| 44361.322916666664 | 14.07 |
| 44361.333333333336 | 14.29 |
| 44361.34375 | 13.71 |
| 44361.354166666664 | 15.92 |
| 44361.364583333336 | 18.09 |
| 44361.375 | 14.84 |
| 44361.385416666664 | 13.64 |
| 44361.395833333336 | 16.12 |
| 44361.40625 | 15.38 |
| 44361.416666666664 | 16.46 |
| 44361.427083333336 | 14.78 |
| 44361.4375 | 16.51 |
| 44361.447916666664 | 13.02 |
| 44361.458333333336 | 17.89 |
| 44361.46875 | 13.73 |
| 44361.479166666664 | 12.46 |
| 44361.489583333336 | 12.42 |
| 44361.5 | 12.38 |
| 44361.510416666664 | 10.64 |
| 44361.520833333336 | 11 |
| 44361.53125 | 10.02 |
| 44361.541666666664 | 9.83 |
| 44361.552083333336 | 9.27 |
| 44361.5625 | 9.32 |
| 44361.572916666664 | 7.79 |
| 44361.583333333336 | 8.47 |
| 44361.59375 | 9.23 |
| 44361.604166666664 | 8.3 |
| 44361.614583333336 | 9.6 |
| 44361.625 | 8.81 |
| 44361.635416666664 | 7.47 |
| 44361.645833333336 | 8.34 |
| 44361.65625 | 9.16 |
| 44361.666666666664 | 9.36 |
| 44361.677083333336 | 7.43 |
| 44361.6875 | 8.89 |
| 44361.697916666664 | 10.59 |
| 44361.708333333336 | 12.87 |
| 44361.71875 | 11.48 |
| 44361.729166666664 | 12.52 |
| 44361.739583333336 | 14.18 |
| 44361.75 | 11.04 |
| 44361.760416666664 | 13.67 |
| 44361.770833333336 | 11.58 |
| 44361.78125 | 12.49 |
| 44361.791666666664 | 13.42 |
| 44361.802083333336 | 17.84 |
| 44361.8125 | 17.1 |
| 44361.822916666664 | 23.06 |
| 44361.833333333336 | 24.73 |
| 44361.84375 | 41.85 |
| 44361.854166666664 | 37.07 |
| 44361.864583333336 | 40.52 |
| 44361.875 | 36.81 |
| 44361.885416666664 | 39.17 |
| 44361.895833333336 | 42.48 |
| 44361.90625 | 40.07 |
| 44361.916666666664 | 30.75 |
| 44361.927083333336 | 32.26 |
| 44361.9375 | 35.71 |
| 44361.947916666664 | 24.02 |
| 44361.958333333336 | 27.24 |
| 44361.96875 | 28.35 |
| 44361.979166666664 | 21.19 |
| 44361.989583333336 | 19.77 |
| 44362.0 | 18.05 |
| 44362.010416666664 | 18.48 |
| 44362.020833333336 | 21.62 |
| 44362.03125 | 19.97 |
| 44362.041666666664 | 20.48 |
| 44362.052083333336 | 18.56 |
| 44362.0625 | 15.32 |
| 44362.072916666664 | 18.5 |
| 44362.083333333336 | 16.2 |
| 44362.09375 | 14.81 |
| 44362.104166666664 | 16.14 |
| 44362.114583333336 | 14.88 |
| 44362.125 | 14.83 |
| 44362.135416666664 | 16.74 |
| 44362.145833333336 | 17.45 |
| 44362.15625 | 17.12 |
| 44362.166666666664 | 17.06 |
| 44362.177083333336 | 16.54 |
| 44362.1875 | 14.45 |
| 44362.197916666664 | 16.44 |
| 44362.208333333336 | 15.73 |
| 44362.21875 | 15.17 |
| 44362.229166666664 | 17.23 |
| 44362.239583333336 | 15.96 |
| 44362.25 | 14.31 |
| 44362.260416666664 | 15.62 |
| 44362.270833333336 | 16.21 |
| 44362.28125 | 13.34 |
| 44362.291666666664 | 13.5 |
| 44362.302083333336 | 13.82 |
| 44362.3125 | 13.75 |
| 44362.322916666664 | 13.11 |
| 44362.333333333336 | 14.37 |
| 44362.34375 | 14.5 |
| 44362.354166666664 | 14.08 |
| 44362.364583333336 | 16.69 |
| 44362.375 | 15.55 |
| 44362.385416666664 | 14.77 |
| 44362.395833333336 | 16.73 |
| 44362.40625 | 15.97 |
| 44362.416666666664 | 16.24 |
| 44362.427083333336 | 18.82 |
| 44362.4375 | 20.21 |
| 44362.447916666664 | 18.23 |
| 44362.458333333336 | 20.51 |
| 44362.46875 | 16.4 |
| 44362.479166666664 | 13.29 |
| 44362.489583333336 | 10.96 |
| 44362.5 | 12.26 |
| 44362.510416666664 | 9.29 |
| 44362.520833333336 | 10.25 |
| 44362.53125 | 11.22 |
| 44362.541666666664 | 9.63 |
| 44362.552083333336 | 8.67 |
| 44362.5625 | 8.98 |
| 44362.572916666664 | 8.18 |
| 44362.583333333336 | 7.93 |
| 44362.59375 | 7.78 |
| 44362.604166666664 | 7.64 |
| 44362.614583333336 | 6.75 |
| 44362.625 | 7.08 |
| 44362.635416666664 | 7 |
| 44362.645833333336 | 6.43 |
| 44362.65625 | 6.58 |
| 44362.666666666664 | 5.25 |
| 44362.677083333336 | 5.8 |
| 44362.6875 | 5.44 |
| 44362.697916666664 | 5.15 |
| 44362.708333333336 | 5.32 |
| 44362.71875 | 4.63 |
| 44362.729166666664 | 5.89 |
| 44362.739583333336 | 6.63 |
| 44362.75 | 6.17 |
| 44362.760416666664 | 7.12 |
| 44362.770833333336 | 11.1 |
| 44362.78125 | 13.65 |
| 44362.791666666664 | 14.66 |
| 44362.802083333336 | 14.02 |
| 44362.8125 | 15.24 |
| 44362.822916666664 | 17.99 |
| 44362.833333333336 | 14.67 |
| 44362.84375 | 15.63 |
| 44362.854166666664 | 17.35 |
| 44362.864583333336 | 16.71 |
| 44362.875 | 17.57 |
| 44362.885416666664 | 20.84 |
| 44362.895833333336 | 20.05 |
| 44362.90625 | 20.07 |
| 44362.916666666664 | 20.48 |
| 44362.927083333336 | 22.66 |
| 44362.9375 | 21.43 |
| 44362.947916666664 | 17.09 |
| 44362.958333333336 | 14.19 |
| 44362.96875 | 12.38 |
| 44362.979166666664 | 13.5 |
| 44362.989583333336 | 10.88 |
| 44363.0 | 7.25 |
| 44363.010416666664 | 12.43 |
| 44363.020833333336 | 11.17 |
| 44363.03125 | 10.14 |
| 44363.041666666664 | 10.52 |
| 44363.052083333336 | 9.73 |
| 44363.0625 | 12.08 |
| 44363.072916666664 | 10.63 |
| 44363.083333333336 | 12.23 |
| 44363.09375 | 12.96 |
| 44363.104166666664 | 10.37 |
| 44363.114583333336 | 9.29 |
| 44363.125 | 9.12 |
| 44363.135416666664 | 9.95 |
| 44363.145833333336 | 11.17 |
| 44363.15625 | 11.7 |
| 44363.166666666664 | 9.57 |
| 44363.177083333336 | 9.2 |
| 44363.1875 | 8.42 |
| 44363.197916666664 | 8.06 |
| 44363.208333333336 | 8.29 |
| 44363.21875 | 7.15 |
| 44363.229166666664 | 6.28 |
| 44363.239583333336 | 7.31 |
| 44363.25 | 7.44 |
| 44363.260416666664 | 6.56 |
| 44363.270833333336 | 5.86 |
| 44363.28125 | 7.67 |
| 44363.291666666664 | 9.37 |
| 44363.302083333336 | 11.24 |
| 44363.3125 | 9.93 |
| 44363.322916666664 | 8.69 |
| 44363.333333333336 | 7.28 |
| 44363.34375 | 9.93 |
| 44363.354166666664 | 7.86 |
| 44363.364583333336 | 12.11 |
| 44363.375 | 10.13 |
| 44363.385416666664 | 9.79 |
| 44363.395833333336 | 11.92 |
| 44363.40625 | 11.07 |
| 44363.416666666664 | 13.02 |
| 44363.427083333336 | 14.15 |
| 44363.4375 | 13.58 |
| 44363.447916666664 | 13.28 |
| 44363.458333333336 | 13.95 |
| 44363.46875 | 10.23 |
| 44363.479166666664 | 8.67 |
| 44363.489583333336 | 10.32 |
| 44363.5 | 12.52 |
| 44363.510416666664 | 11.74 |
| 44363.520833333336 | 9.35 |
| 44363.53125 | 8.17 |
| 44363.541666666664 | 8.11 |
| 44363.552083333336 | 6.38 |
| 44363.5625 | 5.88 |
| 44363.572916666664 | 5.67 |
| 44363.583333333336 | 4.88 |
| 44363.59375 | 5.78 |
| 44363.604166666664 | 5.73 |
| 44363.614583333336 | 5.33 |
| 44363.625 | 4.99 |
| 44363.635416666664 | 5.49 |
| 44363.645833333336 | 4.76 |
| 44363.65625 | 5.38 |
| 44363.666666666664 | 5.53 |
| 44363.677083333336 | 4.51 |
| 44363.6875 | 4.77 |
| 44363.697916666664 | 4.83 |
| 44363.708333333336 | 4.78 |
| 44363.71875 | 4.2 |
| 44363.729166666664 | 4.96 |
| 44363.739583333336 | 5.49 |
| 44363.75 | 5.75 |
| 44363.760416666664 | 5.52 |
| 44363.770833333336 | 6.07 |
| 44363.78125 | 5.54 |
| 44363.791666666664 | 5.98 |
| 44363.802083333336 | 8.12 |
| 44363.8125 | 7.51 |
| 44363.822916666664 | 6.51 |
| 44363.833333333336 | 5.82 |
| 44363.84375 | 5.74 |
| 44363.854166666664 | 6.16 |
| 44363.864583333336 | 4.98 |
| 44363.875 | 5.39 |
| 44363.885416666664 | 7.6 |
| 44363.895833333336 | 7.79 |
| 44363.90625 | 9 |
| 44363.916666666664 | 10.99 |
| 44363.927083333336 | 11.27 |
| 44363.9375 | 13.24 |
| 44363.947916666664 | 12.49 |
| 44363.958333333336 | 16.47 |
| 44363.96875 | 14.69 |
| 44363.979166666664 | 9.15 |
| 44363.989583333336 | 8.48 |
| 44364.0 | 9.1 |
| 44364.010416666664 | 7.15 |
| 44364.020833333336 | 7.13 |
| 44364.03125 | 6.35 |
| 44364.041666666664 | 7.88 |
| 44364.052083333336 | 6.52 |
| 44364.0625 | 7.33 |
| 44364.072916666664 | 7.52 |
| 44364.083333333336 | 7.39 |
| 44364.09375 | 7.23 |
| 44364.104166666664 | 7.84 |
| 44364.114583333336 | 6.72 |
| 44364.125 | 6.82 |
| 44364.135416666664 | 6.91 |
| 44364.145833333336 | 6.45 |
| 44364.15625 | 7.1 |
| 44364.166666666664 | 6.27 |
| 44364.177083333336 | 7.22 |
| 44364.1875 | 6.48 |
| 44364.197916666664 | 6.19 |
| 44364.208333333336 | 6.05 |
| 44364.21875 | 5.25 |
| 44364.229166666664 | 4.24 |
| 44364.239583333336 | 4.69 |
| 44364.25 | 4.51 |
| 44364.260416666664 | 3.45 |
| 44364.270833333336 | 5.68 |
| 44364.28125 | 5.56 |
| 44364.291666666664 | 4.85 |
| 44364.302083333336 | 5.59 |
| 44364.3125 | 6.08 |
| 44364.322916666664 | 7.88 |
| 44364.333333333336 | 6.45 |
| 44364.34375 | 6.2 |
| 44364.354166666664 | 7.23 |
| 44364.364583333336 | 7.48 |
| 44364.375 | 7.27 |
| 44364.385416666664 | 7.29 |
| 44364.395833333336 | 7.21 |
| 44364.40625 | 8.26 |
| 44364.416666666664 | 10.42 |
| 44364.427083333336 | 8.64 |
| 44364.4375 | 8.81 |
| 44364.447916666664 | 9.43 |
| 44364.458333333336 | 10.93 |
| 44364.46875 | 11.76 |
| 44364.479166666664 | 13.36 |
| 44364.489583333336 | 14.99 |
| 44364.5 | 14.13 |
| 44364.510416666664 | 10.23 |
| 44364.520833333336 | 9.52 |
| 44364.53125 | 10.6 |
| 44364.541666666664 | 9.06 |
| 44364.552083333336 | 8.37 |
| 44364.5625 | 9.22 |
| 44364.572916666664 | 7.69 |
| 44364.583333333336 | 7.11 |
| 44364.59375 | 7.11 |
| 44364.604166666664 | 6.02 |
| 44364.614583333336 | 5.79 |
| 44364.625 | 6.85 |
| 44364.635416666664 | 6.24 |
| 44364.645833333336 | 5.44 |
| 44364.65625 | 4.86 |
| 44364.666666666664 | 5.15 |
| 44364.677083333336 | 4.4 |
| 44364.6875 | 4.06 |
| 44364.697916666664 | 4.01 |
| 44364.708333333336 | 4.54 |
| 44364.71875 | 4.16 |
| 44364.729166666664 | 3.73 |
| 44364.739583333336 | 4.66 |
| 44364.75 | 4.85 |
| 44364.760416666664 | 3.98 |
| 44364.770833333336 | 6.46 |
| 44364.78125 | 7.95 |
| 44364.791666666664 | 6.91 |
| 44364.802083333336 | 7.74 |
| 44364.8125 | 8.2 |
| 44364.822916666664 | 8.9 |
| 44364.833333333336 | 9.48 |
| 44364.84375 | 9.45 |
| 44364.854166666664 | 8.04 |
| 44364.864583333336 | 8.38 |
| 44364.875 | 8.11 |
| 44364.885416666664 | 8.42 |
| 44364.895833333336 | 8.94 |
| 44364.90625 | 8.51 |
| 44364.916666666664 | 8.68 |
| 44364.927083333336 | 8.68 |
| 44364.9375 | 8.85 |
| 44364.947916666664 | 9.41 |
| 44364.958333333336 | 9.75 |
| 44364.96875 | 9.63 |
| 44364.979166666664 | 9.17 |
| 44364.989583333336 | 8.94 |
| 44365.0 | 8.5 |
| 44365.010416666664 | 8.13 |
| 44365.020833333336 | 8.23 |
| 44365.03125 | 10.01 |
| 44365.041666666664 | 9.76 |
| 44365.052083333336 | 8.81 |
| 44365.0625 | 8.62 |
| 44365.072916666664 | 7.69 |
| 44365.083333333336 | 8.31 |
| 44365.09375 | 7.19 |
| 44365.104166666664 | 8.04 |
| 44365.114583333336 | 8.47 |
| 44365.125 | 9.08 |
| 44365.135416666664 | 8.95 |
| 44365.145833333336 | 8.5 |
| 44365.15625 | 8.32 |
| 44365.166666666664 | 8.09 |
| 44365.177083333336 | 8.98 |
| 44365.1875 | 8.16 |
| 44365.197916666664 | 7.82 |
| 44365.208333333336 | 8.14 |
| 44365.21875 | 8.59 |
| 44365.229166666664 | 8.64 |
| 44365.239583333336 | 8.38 |
| 44365.25 | 9.18 |
| 44365.260416666664 | 8.2 |
| 44365.270833333336 | 8.55 |
| 44365.28125 | 8.58 |
| 44365.291666666664 | 7.51 |
| 44365.302083333336 | 7.95 |
| 44365.3125 | 7.99 |
| 44365.322916666664 | 8.08 |
| 44365.333333333336 | 6.84 |
| 44365.34375 | 7.17 |
| 44365.354166666664 | 7.18 |
| 44365.364583333336 | 6.28 |
| 44365.375 | 6.79 |
| 44365.385416666664 | 6.59 |
| 44365.395833333336 | 6.45 |
| 44365.40625 | 5.83 |
| 44365.416666666664 | 5.84 |
| 44365.427083333336 | 7.15 |
| 44365.4375 | 7.09 |
| 44365.447916666664 | 8.46 |
| 44365.458333333336 | 9.63 |
| 44365.46875 | 10.77 |
| 44365.479166666664 | 12.12 |
| 44365.489583333336 | 13.4 |
| 44365.5 | 15.13 |
| 44365.510416666664 | 17.59 |
| 44365.520833333336 | 18.85 |
| 44365.53125 | 19.42 |
| 44365.541666666664 | 22.05 |
| 44365.552083333336 | 22.59 |
| 44365.5625 | 22.6 |
| 44365.572916666664 | 19.9 |
| 44365.583333333336 | 18.35 |
| 44365.59375 | 17.2 |
| 44365.604166666664 | 15.71 |
| 44365.614583333336 | 13.69 |
| 44365.625 | 12.87 |
| 44365.635416666664 | 11.03 |
| 44365.645833333336 | 9.89 |
| 44365.65625 | 9.1 |
| 44365.666666666664 | 8.7 |
| 44365.677083333336 | 9.03 |
| 44365.6875 | 7.91 |
| 44365.697916666664 | 31.65 |
| 44365.708333333336 | 7.65 |
| 44365.71875 | 7.63 |
| 44365.729166666664 | 7.99 |
| 44365.739583333336 | 8.34 |
| 44365.75 | 8.24 |
| 44365.760416666664 | 9.07 |
| 44365.770833333336 | 7.99 |
| 44365.78125 | 8.39 |
| 44365.791666666664 | 8.58 |
| 44365.802083333336 | 8.49 |
| 44365.8125 | 9.12 |
| 44365.822916666664 | 9.36 |
| 44365.833333333336 | 9.56 |
| 44365.84375 | 9.84 |
| 44365.854166666664 | 10.57 |
| 44365.864583333336 | 11.22 |
| 44365.875 | 11.12 |
| 44365.885416666664 | 11.58 |
| 44365.895833333336 | 10.95 |
| 44365.90625 | 10.26 |
| 44365.916666666664 | 9.63 |
| 44365.927083333336 | 9.16 |
| 44365.9375 | 9.34 |
| 44365.947916666664 | 9.67 |
| 44365.958333333336 | 9.26 |
| 44365.96875 | 10.59 |
| 44365.979166666664 | 9.67 |
| 44365.989583333336 | 9.41 |
| 44366.0 | 27.38 |
| 44366.010416666664 | 8.41 |
| 44366.020833333336 | 8.67 |
| 44366.03125 | 9.01 |
| 44366.041666666664 | 8.83 |
| 44366.052083333336 | 8.77 |
| 44366.0625 | 8.44 |
| 44366.072916666664 | 7.86 |
| 44366.083333333336 | 8.28 |
| 44366.09375 | 7.73 |
| 44366.104166666664 | 8.05 |
| 44366.114583333336 | 7.51 |
| 44366.125 | 7.82 |
| 44366.135416666664 | 8.39 |
| 44366.145833333336 | 7.89 |
| 44366.15625 | 8.45 |
| 44366.166666666664 | 8.5 |
| 44366.177083333336 | 9.75 |
| 44366.1875 | 9.1 |
| 44366.197916666664 | 9.7 |
| 44366.208333333336 | 9.76 |
| 44366.21875 | 9.79 |
| 44366.229166666664 | 9.92 |
| 44366.239583333336 | 10.32 |
| 44366.25 | 10.87 |
| 44366.260416666664 | 11.21 |
| 44366.270833333336 | 10.93 |
| 44366.28125 | 10.34 |
| 44366.291666666664 | 10.07 |
| 44366.302083333336 | 10.22 |
| 44366.3125 | 10.45 |
| 44366.322916666664 | 10.53 |
| 44366.333333333336 | 9.97 |
| 44366.34375 | 8.09 |
| 44366.354166666664 | 8.43 |
| 44366.364583333336 | 7.7 |
| 44366.375 | 7.78 |
| 44366.385416666664 | 8.94 |
| 44366.395833333336 | 8.3 |
| 44366.40625 | 8 |
| 44366.416666666664 | 7.95 |
| 44366.427083333336 | 7.75 |
| 44366.4375 | 7.48 |
| 44366.447916666664 | 7.7 |
| 44366.458333333336 | 7.29 |
| 44366.46875 | 7.86 |
| 44366.479166666664 | 8.58 |
| 44366.489583333336 | 9.83 |
| 44366.5 | 10.91 |
| 44366.510416666664 | 13.36 |
| 44366.520833333336 | 13.89 |
| 44366.53125 | 18.76 |
| 44366.541666666664 | 18.98 |
| 44366.552083333336 | 20.28 |
| 44366.5625 | 22.47 |
| 44366.572916666664 | 23.26 |
| 44366.583333333336 | 24.17 |
| 44366.59375 | 25.69 |
| 44366.604166666664 | 21.18 |
| 44366.614583333336 | 21.6 |
| 44366.625 | 20.9 |
| 44366.635416666664 | 18.76 |
| 44366.645833333336 | 18.21 |
| 44366.65625 | 16.36 |
| 44366.666666666664 | 13.13 |
| 44366.677083333336 | 11.28 |
| 44366.6875 | 10.72 |
| 44366.697916666664 | 10.26 |
| 44366.708333333336 | 10.07 |
| 44366.71875 | 9.88 |
| 44366.729166666664 | 9.2 |
| 44366.739583333336 | 9.1 |
| 44366.75 | 9.47 |
| 44366.760416666664 | 9.5 |
| 44366.770833333336 | 10.1 |
| 44366.78125 | 9.51 |
| 44366.791666666664 | 9.5 |
| 44366.802083333336 | 9.13 |
| 44366.8125 | 9.11 |
| 44366.822916666664 | 9.04 |
| 44366.833333333336 | 9.08 |
| 44366.84375 | 9.65 |
| 44366.854166666664 | 8.99 |
| 44366.864583333336 | 9.8 |
| 44366.875 | 9.01 |
| 44366.885416666664 | 10.23 |
| 44366.895833333336 | 12.85 |
| 44366.90625 | 16.75 |
| 44366.916666666664 | 13.73 |
| 44366.927083333336 | 11.75 |
| 44366.9375 | 14.5 |
| 44366.947916666664 | 12.7 |
| 44366.958333333336 | 12.88 |
| 44366.96875 | 12.94 |
| 44366.979166666664 | 12.93 |
| 44366.989583333336 | 12.86 |
| 44367.0 | 11.58 |
| 44367.010416666664 | 12.39 |
| 44367.020833333336 | 12.05 |
| 44367.03125 | 12.28 |
| 44367.041666666664 | 11.75 |
| 44367.052083333336 | 11.13 |
| 44367.0625 | 10.51 |
| 44367.072916666664 | 10.28 |
| 44367.083333333336 | 9.53 |
| 44367.09375 | 8.9 |
| 44367.104166666664 | 9.51 |
| 44367.114583333336 | 9.56 |
| 44367.125 | 9.87 |
| 44367.135416666664 | 8.84 |
| 44367.145833333336 | 9.11 |
| 44367.15625 | 8.54 |
| 44367.166666666664 | 8.21 |
| 44367.177083333336 | 7.96 |
| 44367.1875 | 8.6 |
| 44367.197916666664 | 9.16 |
| 44367.208333333336 | 9.5 |
| 44367.21875 | 9.7 |
| 44367.229166666664 | 10.63 |
| 44367.239583333336 | 10.39 |
| 44367.25 | 10.17 |
| 44367.260416666664 | 10.14 |
| 44367.270833333336 | 9.09 |
| 44367.28125 | 9.72 |
| 44367.291666666664 | 9.38 |
| 44367.302083333336 | 8.8 |
| 44367.3125 | 9.17 |
| 44367.322916666664 | 9.04 |
| 44367.333333333336 | 9.69 |
| 44367.34375 | 9.35 |
| 44367.354166666664 | 9.18 |
| 44367.364583333336 | 9.2 |
| 44367.375 | 8.08 |
| 44367.385416666664 | 7.41 |
| 44367.395833333336 | 7.91 |
| 44367.40625 | 7.55 |
| 44367.416666666664 | 7.76 |
| 44367.427083333336 | 6.42 |
| 44367.4375 | 7.24 |
| 44367.447916666664 | 6.19 |
| 44367.458333333336 | 6.98 |
| 44367.46875 | 6.76 |
| 44367.479166666664 | 7.23 |
| 44367.489583333336 | 7.53 |
| 44367.5 | 7.44 |
| 44367.510416666664 | 8.49 |
| 44367.520833333336 | 9.82 |
| 44367.53125 | 10.97 |
| 44367.541666666664 | 13.08 |
| 44367.552083333336 | 14.91 |
| 44367.5625 | 17.07 |
| 44367.572916666664 | 20.33 |
| 44367.583333333336 | 21.73 |
| 44367.59375 | 25.85 |
| 44367.604166666664 | 24.67 |
| 44367.614583333336 | 25.4 |
| 44367.625 | 30.78 |
| 44367.635416666664 | 25.65 |
| 44367.645833333336 | 23.73 |
| 44367.65625 | 23.71 |
| 44367.666666666664 | 21.69 |
| 44367.677083333336 | 21.1 |
| 44367.6875 | 18.63 |
| 44367.697916666664 | 14.89 |
| 44367.708333333336 | 13.21 |
| 44367.71875 | 12.7 |
| 44367.729166666664 | 12.77 |
| 44367.739583333336 | 11.8 |
| 44367.75 | 11.28 |
| 44367.760416666664 | 11.04 |
| 44367.770833333336 | 14.37 |
| 44367.78125 | 10.66 |
| 44367.791666666664 | 10.46 |
| 44367.802083333336 | 9.84 |
| 44367.8125 | 9.67 |
| 44367.822916666664 | 8.93 |
| 44367.833333333336 | 9.86 |
| 44367.84375 | 10.25 |
| 44367.854166666664 | 9.62 |
| 44367.864583333336 | 8.97 |
| 44367.875 | 8.57 |
| 44367.885416666664 | 8.52 |
| 44367.895833333336 | 8.06 |
| 44367.90625 | 7.48 |
| 44367.916666666664 | 7.65 |
| 44367.927083333336 | 8.12 |
| 44367.9375 | 8.73 |
| 44367.947916666664 | 9.11 |
| 44367.958333333336 | 10.2 |
| 44367.96875 | 10.04 |
| 44367.979166666664 | 10.23 |
| 44367.989583333336 | 11.24 |
| 44368.0 | 12.21 |
| 44368.010416666664 | 12.03 |
| 44368.020833333336 | 11.66 |
| 44368.03125 | 12.09 |
| 44368.041666666664 | 11.84 |
| 44368.052083333336 | 12.35 |
| 44368.0625 | 12.34 |
| 44368.072916666664 | 12.62 |
| 44368.083333333336 | 12.52 |
| 44368.09375 | 11.3 |
| 44368.104166666664 | 11.2 |
| 44368.114583333336 | 10.96 |
| 44368.125 | 10.51 |
| 44368.135416666664 | 10.13 |
| 44368.145833333336 | 9.85 |
| 44368.15625 | 10.23 |
| 44368.166666666664 | 10.13 |
| 44368.177083333336 | 9.39 |
| 44368.1875 | 9.15 |
| 44368.197916666664 | 9.43 |
| 44368.208333333336 | 8.78 |
| 44368.21875 | 9.94 |
| 44368.229166666664 | 9.28 |
| 44368.239583333336 | 8.96 |
| 44368.25 | 8.08 |
| 44368.260416666664 | 9.24 |
| 44368.270833333336 | 9.47 |
| 44368.28125 | 8.93 |
| 44368.291666666664 | 9.37 |
| 44368.302083333336 | 8.63 |
| 44368.3125 | 9.3 |
| 44368.322916666664 | 9.02 |
| 44368.333333333336 | 8.53 |
| 44368.34375 | 8.14 |
| 44368.354166666664 | 7.77 |
| 44368.364583333336 | 7.7 |
| 44368.375 | 7.32 |
| 44368.385416666664 | 7.2 |
| 44368.395833333336 | 7.15 |
| 44368.40625 | 6.85 |
| 44368.416666666664 | 6.62 |
| 44368.427083333336 | 6.11 |
| 44368.4375 | 5.55 |
| 44368.447916666664 | 5.12 |
| 44368.458333333336 | 5.06 |
| 44368.46875 | 5.53 |
| 44368.479166666664 | 5.66 |
| 44368.489583333336 | 5.95 |
| 44368.5 | 6.05 |
| 44368.510416666664 | 6.19 |
| 44368.520833333336 | 6.84 |
| 44368.53125 | 7.41 |
| 44368.541666666664 | 7.78 |
| 44368.552083333336 | 8.66 |
| 44368.5625 | 9.87 |
| 44368.572916666664 | 11.37 |
| 44368.583333333336 | 12.58 |
| 44368.59375 | 15.17 |
| 44368.604166666664 | 28.63 |
| 44368.614583333336 | 18.96 |
| 44368.625 | 20.11 |
| 44368.635416666664 | 26.86 |
| 44368.645833333336 | 22.59 |
| 44368.65625 | 29.5 |
| 44368.666666666664 | 25.88 |
| 44368.677083333336 | 22.69 |
| 44368.6875 | 21.98 |
| 44368.697916666664 | 19.37 |
| 44368.708333333336 | 18.8 |
| 44368.71875 | 16.97 |
| 44368.729166666664 | 15.57 |
| 44368.739583333336 | 13.54 |
| 44368.75 | 12.78 |
| 44368.760416666664 | 12.01 |
| 44368.770833333336 | 10.58 |
| 44368.78125 | 10.44 |
| 44368.791666666664 | 10.33 |
| 44368.802083333336 | 9.74 |
| 44368.8125 | 9.61 |
| 44368.822916666664 | 9.78 |
| 44368.833333333336 | 9.8 |
| 44368.84375 | 10.04 |
| 44368.854166666664 | 9.49 |
| 44368.864583333336 | 10.34 |
| 44368.875 | 9.51 |
| 44368.885416666664 | 9.41 |
| 44368.895833333336 | 9.2 |
| 44368.90625 | 9.86 |
| 44368.916666666664 | 9.46 |
| 44368.927083333336 | 9.61 |
| 44368.9375 | 9.16 |
| 44368.947916666664 | 9.3 |
| 44368.958333333336 | 8.59 |
| 44368.96875 | 7.59 |
| 44368.979166666664 | 8.47 |
| 44368.989583333336 | 7.97 |
| 44369.0 | 9.52 |
| 44369.010416666664 | 11.2 |
| 44369.020833333336 | 10.97 |
| 44369.03125 | 11.78 |
| 44369.041666666664 | 10.53 |
| 44369.052083333336 | 10.71 |
| 44369.0625 | 10.8 |
| 44369.072916666664 | 10.18 |
| 44369.083333333336 | 11.34 |
| 44369.09375 | 11.01 |
| 44369.104166666664 | 11.13 |
| 44369.114583333336 | 10.89 |
| 44369.125 | 10.93 |
| 44369.135416666664 | 10.42 |
| 44369.145833333336 | 10.18 |
| 44369.15625 | 9.99 |
| 44369.166666666664 | 9.78 |
| 44369.177083333336 | 9.46 |
| 44369.1875 | 8.87 |
| 44369.197916666664 | 8.99 |
| 44369.208333333336 | 9.64 |
| 44369.21875 | 8.94 |
| 44369.229166666664 | 9.03 |
| 44369.239583333336 | 8.55 |
| 44369.25 | 8.6 |
| 44369.260416666664 | 8.21 |
| 44369.270833333336 | 8.35 |
| 44369.28125 | 7.8 |
| 44369.291666666664 | 8.2 |
| 44369.302083333336 | 7.91 |
| 44369.3125 | 8.62 |
| 44369.322916666664 | 7.78 |
| 44369.333333333336 | 7.92 |
| 44369.34375 | 8.11 |
| 44369.354166666664 | 8.02 |
| 44369.364583333336 | 8.08 |
| 44369.375 | 8.06 |
| 44369.385416666664 | 7.96 |
| 44369.395833333336 | 7.49 |
| 44369.40625 | 6.94 |
| 44369.416666666664 | 6.52 |
| 44369.427083333336 | 6.56 |
| 44369.4375 | 5.92 |
| 44369.447916666664 | 6.14 |
| 44369.458333333336 | 5.36 |
| 44369.46875 | 5.36 |
| 44369.479166666664 | 5.56 |
| 44369.489583333336 | 5.46 |
| 44369.5 | 5.64 |
| 44369.510416666664 | 5.19 |
| 44369.520833333336 | 5.16 |
| 44369.53125 | 5.56 |
| 44369.541666666664 | 6.41 |
| 44369.552083333336 | 6.43 |
| 44369.5625 | 6.59 |
| 44369.572916666664 | 6.98 |
| 44369.583333333336 | 7.65 |
| 44369.59375 | 8.43 |
| 44369.604166666664 | 10.15 |
| 44369.614583333336 | 11.15 |
| 44369.625 | 12.74 |
| 44369.635416666664 | 13.42 |
| 44369.645833333336 | 15.5 |
| 44369.65625 | 18.59 |
| 44369.666666666664 | 19.63 |
| 44369.677083333336 | 25.33 |
| 44369.6875 | 27.25 |
| 44369.697916666664 | 33.01 |
| 44369.708333333336 | 34.55 |
| 44369.71875 | 26.58 |
| 44369.729166666664 | 24.34 |
| 44369.739583333336 | 21.3 |
| 44369.75 | 19.91 |
| 44369.760416666664 | 18.13 |
| 44369.770833333336 | 14.7 |
| 44369.78125 | 13.65 |
| 44369.791666666664 | 12.6 |
| 44369.802083333336 | 11.38 |
| 44369.8125 | 10.78 |
| 44369.822916666664 | 10.8 |
| 44369.833333333336 | 12.32 |
| 44369.84375 | 10.09 |
| 44369.854166666664 | 10.14 |
| 44369.864583333336 | 9.64 |
| 44369.875 | 9.47 |
| 44369.885416666664 | 9.26 |
| 44369.895833333336 | 8.47 |
| 44369.90625 | 8 |
| 44369.916666666664 | 7.67 |
| 44369.927083333336 | 7.08 |
| 44369.9375 | 7.67 |
| 44369.947916666664 | 7.27 |
| 44369.958333333336 | 7.13 |
| 44369.96875 | 6.93 |
| 44369.979166666664 | 6.93 |
| 44369.989583333336 | 6.91 |
| 44370.0 | 7.18 |
| 44370.010416666664 | 7.74 |
| 44370.020833333336 | 6.93 |
| 44370.03125 | 6.51 |
| 44370.041666666664 | 6.46 |
| 44370.052083333336 | 6.35 |
| 44370.0625 | 6.15 |
| 44370.072916666664 | 6.82 |
| 44370.083333333336 | 7.59 |
| 44370.09375 | 6.63 |
| 44370.104166666664 | 7.53 |
| 44370.114583333336 | 7.99 |
| 44370.125 | 6.54 |
| 44370.135416666664 | 7.67 |
| 44370.145833333336 | 7.89 |
| 44370.15625 | 7.41 |
| 44370.166666666664 | 8.05 |
| 44370.177083333336 | 7.81 |
| 44370.1875 | 8.01 |
| 44370.197916666664 | 7.55 |
| 44370.208333333336 | 7.93 |
| 44370.21875 | 7.55 |
| 44370.229166666664 | 7.66 |
| 44370.239583333336 | 7.96 |
| 44370.25 | 7.29 |
| 44370.260416666664 | 8.39 |
| 44370.270833333336 | 6.98 |
| 44370.28125 | 7.39 |
| 44370.291666666664 | 7.27 |
| 44370.302083333336 | 7.33 |
| 44370.3125 | 6.7 |
| 44370.322916666664 | 6.05 |
| 44370.333333333336 | 6.05 |
| 44370.34375 | 6.41 |
| 44370.354166666664 | 6 |
| 44370.364583333336 | 5.95 |
| 44370.375 | 5.8 |
| 44370.385416666664 | 5.92 |
| 44370.395833333336 | 6.19 |
| 44370.40625 | 5.63 |
| 44370.416666666664 | 5.42 |
| 44370.427083333336 | 5.09 |
| 44370.4375 | 5.01 |
| 44370.447916666664 | 5.04 |
| 44370.458333333336 | 5.05 |
| 44370.46875 | 4.55 |
| 44370.479166666664 | 4.28 |
| 44370.489583333336 | 4.34 |
| 44370.5 | 4.47 |
| 44370.510416666664 | 4.47 |
| 44370.520833333336 | 4.25 |
| 44370.53125 | 4.58 |
| 44370.541666666664 | 4.45 |
| 44370.552083333336 | 4.83 |
| 44370.5625 | 5.34 |
| 44370.572916666664 | 5.32 |
| 44370.583333333336 | 4.84 |
| 44370.59375 | 5.91 |
| 44370.604166666664 | 5.84 |
| 44370.614583333336 | 6.48 |
| 44370.625 | 7.25 |
| 44370.635416666664 | 7.32 |
| 44370.645833333336 | 8.88 |
| 44370.65625 | 14.01 |
| 44370.666666666664 | 11.29 |
| 44370.677083333336 | 13.56 |
| 44370.6875 | 16.92 |
| 44370.697916666664 | 16.01 |
| 44370.708333333336 | 27.42 |
| 44370.71875 | 22.98 |
| 44370.729166666664 | 28.1 |
| 44370.739583333336 | 31.93 |
| 44370.75 | 28.57 |
| 44370.760416666664 | 31.7 |
| 44370.770833333336 | 30.61 |
| 44370.78125 | 30.07 |
| 44370.791666666664 | 32.77 |
| 44370.802083333336 | 30.19 |
| 44370.8125 | 26.15 |
| 44370.822916666664 | 22.94 |
| 44370.833333333336 | 18.52 |
| 44370.84375 | 16.25 |
| 44370.854166666664 | 16.21 |
| 44370.864583333336 | 15.4 |
| 44370.875 | 13.76 |
| 44370.885416666664 | 13.81 |
| 44370.895833333336 | 16.26 |
| 44370.90625 | 12.74 |
| 44370.916666666664 | 12.11 |
| 44370.927083333336 | 11.89 |
| 44370.9375 | 9.92 |
| 44370.947916666664 | 10.18 |
| 44370.958333333336 | 9.47 |
| 44370.96875 | 9.13 |
| 44370.979166666664 | 8.72 |
| 44370.989583333336 | 8.93 |
| 44371.0 | 8.99 |
| 44371.010416666664 | 8.33 |
| 44371.020833333336 | 8.36 |
| 44371.03125 | 7.8 |
| 44371.041666666664 | 7.99 |
| 44371.052083333336 | 7.75 |
| 44371.0625 | 7.7 |
| 44371.072916666664 | 7.27 |
| 44371.083333333336 | 7.45 |
| 44371.09375 | 8.02 |
| 44371.104166666664 | 8.4 |
| 44371.114583333336 | 8.84 |
| 44371.125 | 8.96 |
| 44371.135416666664 | 8.44 |
| 44371.145833333336 | 8.57 |
| 44371.15625 | 8.32 |
| 44371.166666666664 | 7.75 |
| 44371.177083333336 | 7.96 |
| 44371.1875 | 9.2 |
| 44371.197916666664 | 11.35 |
| 44371.208333333336 | 9.19 |
| 44371.21875 | 11.83 |
| 44371.229166666664 | 12.5 |
| 44371.239583333336 | 11.59 |
| 44371.25 | 11.73 |
| 44371.260416666664 | 12.29 |
| 44371.270833333336 | 11.99 |
| 44371.28125 | 10.96 |
| 44371.291666666664 | 11.66 |
| 44371.302083333336 | 11.38 |
| 44371.3125 | 9.78 |
| 44371.322916666664 | 9.79 |
| 44371.333333333336 | 9.53 |
| 44371.34375 | 8.79 |
| 44371.354166666664 | 8.36 |
| 44371.364583333336 | 8.63 |
| 44371.375 | 8.31 |
| 44371.385416666664 | 8.1 |
| 44371.395833333336 | 7.61 |
| 44371.40625 | 7.47 |
| 44371.416666666664 | 7.01 |
| 44371.427083333336 | 6.71 |
| 44371.4375 | 6.64 |
| 44371.447916666664 | 6.88 |
| 44371.458333333336 | 6.66 |
| 44371.46875 | 6.35 |
| 44371.479166666664 | 6.29 |
| 44371.489583333336 | 6.24 |
| 44371.5 | 6 |
| 44371.510416666664 | 5.94 |
| 44371.520833333336 | 5.81 |
| 44371.53125 | 5.54 |
| 44371.541666666664 | 5.21 |
| 44371.552083333336 | 5.4 |
| 44371.5625 | 5.84 |
| 44371.572916666664 | 6.06 |
| 44371.583333333336 | 6.49 |
| 44371.59375 | 7.2 |
| 44371.604166666664 | 7.68 |
| 44371.614583333336 | 8.48 |
| 44371.625 | 8.44 |
| 44371.635416666664 | 9.1 |
| 44371.645833333336 | 10.56 |
| 44371.65625 | 12.06 |
| 44371.666666666664 | 12.03 |
| 44371.677083333336 | 14.45 |
| 44371.6875 | 14.72 |
| 44371.697916666664 | 17.45 |
| 44371.708333333336 | 18.45 |
| 44371.71875 | 20.33 |
| 44371.729166666664 | 20.35 |
| 44371.739583333336 | 23.84 |
| 44371.75 | 30.57 |
| 44371.760416666664 | 34.84 |
| 44371.770833333336 | 33.73 |
| 44371.78125 | 28.37 |
| 44371.791666666664 | 30.43 |
| 44371.802083333336 | 31.06 |
| 44371.8125 | 32.65 |
| 44371.822916666664 | 34.96 |
| 44371.833333333336 | 36.76 |
| 44371.84375 | 33.75 |
| 44371.854166666664 | 30.69 |
| 44371.864583333336 | 27.39 |
| 44371.875 | 24.02 |
| 44371.885416666664 | 21.64 |
| 44371.895833333336 | 21.07 |
| 44371.90625 | 19.16 |
| 44371.916666666664 | 17.01 |
| 44371.927083333336 | 15.71 |
| 44371.9375 | 13.68 |
| 44371.947916666664 | 12.83 |
| 44371.958333333336 | 12.5 |
| 44371.96875 | 11.6 |
| 44371.979166666664 | 11.1 |
| 44371.989583333336 | 11.05 |
| 44372.0 | 10.21 |
| 44372.010416666664 | 10.72 |
| 44372.020833333336 | 10.4 |
| 44372.03125 | 10.66 |
| 44372.041666666664 | 10.03 |
| 44372.052083333336 | 9.82 |
| 44372.0625 | 9.35 |
| 44372.072916666664 | 8.43 |
| 44372.083333333336 | 8.53 |
| 44372.09375 | 8.95 |
| 44372.104166666664 | 9.04 |
| 44372.114583333336 | 9.12 |
| 44372.125 | 8.82 |
| 44372.135416666664 | 9.81 |
| 44372.145833333336 | 9.4 |
| 44372.15625 | 13.1 |
| 44372.166666666664 | 8.5 |
| 44372.177083333336 | 8.73 |
| 44372.1875 | 9.24 |
| 44372.197916666664 | 8.53 |
| 44372.208333333336 | 9.56 |
| 44372.21875 | 9.83 |
| 44372.229166666664 | 10.98 |
| 44372.239583333336 | 10.43 |
| 44372.25 | 9.81 |
| 44372.260416666664 | 10.46 |
| 44372.270833333336 | 10.71 |
| 44372.28125 | 10.14 |
| 44372.291666666664 | 11.02 |
| 44372.302083333336 | 11.08 |
| 44372.3125 | 11.58 |
| 44372.322916666664 | 11.67 |
| 44372.333333333336 | 12.54 |
| 44372.34375 | 12.48 |
| 44372.354166666664 | 10.29 |
| 44372.364583333336 | 10.32 |
| 44372.375 | 9.9 |
| 44372.385416666664 | 9.69 |
| 44372.395833333336 | 9.21 |
| 44372.40625 | 9.07 |
| 44372.416666666664 | 8 |
| 44372.427083333336 | 7.67 |
| 44372.4375 | 7.38 |
| 44372.447916666664 | 7.55 |
| 44372.458333333336 | 7.39 |
| 44372.46875 | 7.35 |
| 44372.479166666664 | 7.29 |
| 44372.489583333336 | 6.88 |
| 44372.5 | 6.91 |
| 44372.510416666664 | 6.81 |
| 44372.520833333336 | 6.61 |
| 44372.53125 | 6.78 |
| 44372.541666666664 | 6.41 |
| 44372.552083333336 | 6.58 |
| 44372.5625 | 6.39 |
| 44372.572916666664 | 6.29 |
| 44372.583333333336 | 6.9 |
| 44372.59375 | 7.46 |
| 44372.604166666664 | 7 |
| 44372.614583333336 | 6.9 |
| 44372.625 | 6.62 |
| 44372.635416666664 | 7.4 |
| 44372.645833333336 | 8.7 |
| 44372.65625 | 8.84 |
| 44372.666666666664 | 8.27 |
| 44372.677083333336 | 9.71 |
| 44372.6875 | 10.46 |
| 44372.697916666664 | 11.28 |
| 44372.708333333336 | 12.16 |
| 44372.71875 | 12.43 |
| 44372.729166666664 | 13.73 |
| 44372.739583333336 | 16.85 |
| 44372.75 | 18.31 |
| 44372.760416666664 | 22.87 |
| 44372.770833333336 | 26.38 |
| 44372.78125 | 28.3 |
| 44372.791666666664 | 35.14 |
| 44372.802083333336 | 37.94 |
| 44372.8125 | 39.97 |
| 44372.822916666664 | 43.79 |
| 44372.833333333336 | 46.14 |
| 44372.84375 | 44.54 |
| 44372.854166666664 | 40.71 |
| 44372.864583333336 | 42.98 |
| 44372.875 | 39.46 |
| 44372.885416666664 | 35.25 |
| 44372.895833333336 | 31.97 |
| 44372.90625 | 27.96 |
| 44372.916666666664 | 24.5 |
| 44372.927083333336 | 22 |
| 44372.9375 | 20.2 |
| 44372.947916666664 | 17.77 |
| 44372.958333333336 | 15.71 |
| 44372.96875 | 15.35 |
| 44372.979166666664 | 13.48 |
| 44372.989583333336 | 13.05 |
| 44373.0 | 12.68 |
| 44373.010416666664 | 11.89 |
| 44373.020833333336 | 11.77 |
| 44373.03125 | 11.44 |
| 44373.041666666664 | 10.86 |
| 44373.052083333336 | 10.47 |
| 44373.0625 | 9.99 |
| 44373.072916666664 | 9.88 |
| 44373.083333333336 | 9.54 |
| 44373.09375 | 9.27 |
| 44373.104166666664 | 9.22 |
| 44373.114583333336 | 9.02 |
| 44373.125 | 9.29 |
| 44373.135416666664 | 8.81 |
| 44373.145833333336 | 8.33 |
| 44373.15625 | 8.36 |
| 44373.166666666664 | 7.99 |
| 44373.177083333336 | 8.18 |
| 44373.1875 | 9.06 |
| 44373.197916666664 | 9.1 |
| 44373.208333333336 | 8.68 |
| 44373.21875 | 8.41 |
| 44373.229166666664 | 8.54 |
| 44373.239583333336 | 8.99 |
| 44373.25 | 10.06 |
| 44373.260416666664 | 9.96 |
| 44373.270833333336 | 10.03 |
| 44373.28125 | 9.74 |
| 44373.291666666664 | 9.74 |
| 44373.302083333336 | 10.04 |
| 44373.3125 | 10.59 |
| 44373.322916666664 | 11.03 |
| 44373.333333333336 | 11.58 |
| 44373.34375 | 12.28 |
| 44373.354166666664 | 13.3 |
| 44373.364583333336 | 13.96 |
| 44373.375 | 13.66 |
| 44373.385416666664 | 12.23 |
| 44373.395833333336 | 12.3 |
| 44373.40625 | 11.27 |
| 44373.416666666664 | 10.24 |
| 44373.427083333336 | 9.57 |
| 44373.4375 | 9.31 |
| 44373.447916666664 | 9.44 |
| 44373.458333333336 | 9.23 |
| 44373.46875 | 8.91 |
| 44373.479166666664 | 8.91 |
| 44373.489583333336 | 8.45 |
| 44373.5 | 8.4 |
| 44373.510416666664 | 8.25 |
| 44373.520833333336 | 8.37 |
| 44373.53125 | 7.74 |
| 44373.541666666664 | 7.71 |
| 44373.552083333336 | 7.64 |
| 44373.5625 | 7.48 |
| 44373.572916666664 | 7.46 |
| 44373.583333333336 | 7.53 |
| 44373.59375 | 7.54 |
| 44373.604166666664 | 7.31 |
| 44373.614583333336 | 7.29 |
| 44373.625 | 8.57 |
| 44373.635416666664 | 9.41 |
| 44373.645833333336 | 8.93 |
| 44373.65625 | 8.66 |
| 44373.666666666664 | 8.71 |
| 44373.677083333336 | 9.57 |
| 44373.6875 | 9.9 |
| 44373.697916666664 | 11.84 |
| 44373.708333333336 | 12.83 |
| 44373.71875 | 13.78 |
| 44373.729166666664 | 13.09 |
| 44373.739583333336 | 15.28 |
| 44373.75 | 19 |
| 44373.760416666664 | 20.65 |
| 44373.770833333336 | 21.6 |
| 44373.78125 | 21.88 |
| 44373.791666666664 | 27.12 |
| 44373.802083333336 | 33.04 |
| 44373.8125 | 36.78 |
| 44373.822916666664 | 41.56 |
| 44373.833333333336 | 46.63 |
| 44373.84375 | 53.44 |
| 44373.854166666664 | 52.96 |
| 44373.864583333336 | 54.68 |
| 44373.875 | 53.87 |
| 44373.885416666664 | 49.41 |
| 44373.895833333336 | 42.42 |
| 44373.90625 | 39.91 |
| 44373.916666666664 | 34.66 |
| 44373.927083333336 | 30.31 |
| 44373.9375 | 25.4 |
| 44373.947916666664 | 23.16 |
| 44373.958333333336 | 21.12 |
| 44373.96875 | 19.32 |
| 44373.979166666664 | 17.47 |
| 44373.989583333336 | 17.4 |
| 44374.0 | 16.99 |
| 44374.010416666664 | 16.51 |
| 44374.020833333336 | 16.78 |
| 44374.03125 | 15.84 |
| 44374.041666666664 | 15.08 |
| 44374.052083333336 | 14.48 |
| 44374.0625 | 13.96 |
| 44374.072916666664 | 13.39 |
| 44374.083333333336 | 12.84 |
| 44374.09375 | 12.46 |
| 44374.104166666664 | 11.95 |
| 44374.114583333336 | 11.64 |
| 44374.125 | 11.19 |
| 44374.135416666664 | 11.13 |
| 44374.145833333336 | 10.48 |
| 44374.15625 | 10.16 |
| 44374.166666666664 | 10.61 |
| 44374.177083333336 | 10 |
| 44374.1875 | 12.98 |
| 44374.197916666664 | 12.86 |
| 44374.208333333336 | 11.08 |
| 44374.21875 | 11.05 |
| 44374.229166666664 | 11.16 |
| 44374.239583333336 | 11.64 |
| 44374.25 | 10.65 |
| 44374.260416666664 | 10.82 |
| 44374.270833333336 | 10.07 |
| 44374.28125 | 9.85 |
| 44374.291666666664 | 9.92 |
| 44374.302083333336 | 10.27 |
| 44374.3125 | 11.69 |
| 44374.322916666664 | 10.82 |
| 44374.333333333336 | 11.32 |
| 44374.34375 | 11.88 |
| 44374.354166666664 | 12.88 |
| 44374.364583333336 | 13.1 |
| 44374.375 | 14.87 |
| 44374.385416666664 | 15.32 |
| 44374.395833333336 | 15.65 |
| 44374.40625 | 15.56 |
| 44374.416666666664 | 13.7 |
| 44374.427083333336 | 13.33 |
| 44374.4375 | 13.38 |
| 44374.447916666664 | 12.17 |
| 44374.458333333336 | 11.49 |
| 44374.46875 | 10.95 |
| 44374.479166666664 | 10.46 |
| 44374.489583333336 | 10.26 |
| 44374.5 | 9.88 |
| 44374.510416666664 | 9.22 |
| 44374.520833333336 | 9.22 |
| 44374.53125 | 9.01 |
| 44374.541666666664 | 8.86 |
| 44374.552083333336 | 8.85 |
| 44374.5625 | 8.48 |
| 44374.572916666664 | 8.3 |
| 44374.583333333336 | 8.24 |
| 44374.59375 | 8.18 |
| 44374.604166666664 | 8.31 |
| 44374.614583333336 | 8.05 |
| 44374.625 | 8.02 |
| 44374.635416666664 | 8.12 |
| 44374.645833333336 | 8.22 |
| 44374.65625 | 8.39 |
| 44374.666666666664 | 9.37 |
| 44374.677083333336 | 9.68 |
| 44374.6875 | 10.1 |
| 44374.697916666664 | 8.3 |
| 44374.708333333336 | 9.09 |
| 44374.71875 | 9.32 |
| 44374.729166666664 | 10.59 |
| 44374.739583333336 | 10.5 |
| 44374.75 | 11.05 |
| 44374.760416666664 | 10.42 |
| 44374.770833333336 | 12.63 |
| 44374.78125 | 14.55 |
| 44374.791666666664 | 18.32 |
| 44374.802083333336 | 19.89 |
| 44374.8125 | 22.25 |
| 44374.822916666664 | 26.1 |
| 44374.833333333336 | 31.78 |
| 44374.84375 | 36.35 |
| 44374.854166666664 | 41.41 |
| 44374.864583333336 | 48.53 |
| 44374.875 | 50.15 |
| 44374.885416666664 | 52.97 |
| 44374.895833333336 | 53.5 |
| 44374.90625 | 51.8 |
| 44374.916666666664 | 48.55 |
| 44374.927083333336 | 44.14 |
| 44374.9375 | 38.56 |
| 44374.947916666664 | 33.54 |
| 44374.958333333336 | 29.76 |
| 44374.96875 | 25.21 |
| 44374.979166666664 | 21.46 |
| 44374.989583333336 | 19.47 |
| 44375.0 | 17.9 |
| 44375.010416666664 | 16.7 |
| 44375.020833333336 | 16.87 |
| 44375.03125 | 16.59 |
| 44375.041666666664 | 16.89 |
| 44375.052083333336 | 16.95 |
| 44375.0625 | 16.81 |
| 44375.072916666664 | 16.97 |
| 44375.083333333336 | 15.8 |
| 44375.09375 | 14.58 |
| 44375.104166666664 | 14 |
| 44375.114583333336 | 13.52 |
| 44375.125 | 13.91 |
| 44375.135416666664 | 13.21 |
| 44375.145833333336 | 13.47 |
| 44375.15625 | 12.67 |
| 44375.166666666664 | 12.81 |
| 44375.177083333336 | 12.36 |
| 44375.1875 | 10.85 |
| 44375.197916666664 | 10.58 |
| 44375.208333333336 | 10.07 |
| 44375.21875 | 10.94 |
| 44375.229166666664 | 10.81 |
| 44375.239583333336 | 10.59 |
| 44375.25 | 10.78 |
| 44375.260416666664 | 10.16 |
| 44375.270833333336 | 10.1 |
| 44375.28125 | 9.51 |
| 44375.291666666664 | 10.05 |
| 44375.302083333336 | 10.12 |
| 44375.3125 | 10.63 |
| 44375.322916666664 | 11.1 |
| 44375.333333333336 | 10.51 |
| 44375.34375 | 11.3 |
| 44375.354166666664 | 11.21 |
| 44375.364583333336 | 11.72 |
| 44375.375 | 12.39 |
| 44375.385416666664 | 13.73 |
| 44375.395833333336 | 14.35 |
| 44375.40625 | 14.98 |
| 44375.416666666664 | 15 |
| 44375.427083333336 | 16.16 |
| 44375.4375 | 17.95 |
| 44375.447916666664 | 16.76 |
| 44375.458333333336 | 15.11 |
| 44375.46875 | 15.87 |
| 44375.479166666664 | 13.98 |
| 44375.489583333336 | 13.02 |
| 44375.5 | 12.84 |
| 44375.510416666664 | 12.55 |
| 44375.520833333336 | 11.61 |
| 44375.53125 | 11.28 |
| 44375.541666666664 | 10.55 |
| 44375.552083333336 | 10.63 |
| 44375.5625 | 10.09 |
| 44375.572916666664 | 10 |
| 44375.583333333336 | 9.69 |
| 44375.59375 | 9.7 |
| 44375.604166666664 | 9.56 |
| 44375.614583333336 | 9.75 |
| 44375.625 | 9.65 |
| 44375.635416666664 | 9.41 |
| 44375.645833333336 | 8.97 |
| 44375.65625 | 9.19 |
| 44375.666666666664 | 8.96 |
| 44375.677083333336 | 9.47 |
| 44375.6875 | 9.46 |
| 44375.697916666664 | 8.9 |
| 44375.708333333336 | 11.25 |
| 44375.71875 | 10.07 |
| 44375.729166666664 | 9.62 |
| 44375.739583333336 | 9.48 |
| 44375.75 | 10.44 |
| 44375.760416666664 | 8.97 |
| 44375.770833333336 | 11.31 |
| 44375.78125 | 11.38 |
| 44375.791666666664 | 11.83 |
| 44375.802083333336 | 12.27 |
| 44375.8125 | 14.33 |
| 44375.822916666664 | 17.35 |
| 44375.833333333336 | 20.32 |
| 44375.84375 | 21.73 |
| 44375.854166666664 | 22.95 |
| 44375.864583333336 | 25.65 |
| 44375.875 | 27.41 |
| 44375.885416666664 | 30.29 |
| 44375.895833333336 | 32.08 |
| 44375.90625 | 33.26 |
| 44375.916666666664 | 33.44 |
| 44375.927083333336 | 31.15 |
| 44375.9375 | 28.53 |
| 44375.947916666664 | 28.33 |
| 44375.958333333336 | 24.68 |
| 44375.96875 | 22.79 |
| 44375.979166666664 | 19.54 |
| 44375.989583333336 | 16.61 |
| 44376.0 | 17.3 |
| 44376.010416666664 | 16.62 |
| 44376.020833333336 | 16.51 |
| 44376.03125 | 18.02 |
| 44376.041666666664 | 19.35 |
| 44376.052083333336 | 18.34 |
| 44376.0625 | 18.8 |
| 44376.072916666664 | 19.75 |
| 44376.083333333336 | 20.16 |
| 44376.09375 | 21.49 |
| 44376.104166666664 | 22.28 |
| 44376.114583333336 | 20.61 |
| 44376.125 | 19.19 |
| 44376.135416666664 | 18.29 |
| 44376.145833333336 | 16.22 |
| 44376.15625 | 15.55 |
| 44376.166666666664 | 15.97 |
| 44376.177083333336 | 15.38 |
| 44376.1875 | 15.21 |
| 44376.197916666664 | 14.71 |
| 44376.208333333336 | 14.79 |
| 44376.21875 | 14.25 |
| 44376.229166666664 | 13.51 |
| 44376.239583333336 | 13.64 |
| 44376.25 | 14 |
| 44376.260416666664 | 13.48 |
| 44376.270833333336 | 13.47 |
| 44376.28125 | 13.77 |
| 44376.291666666664 | 13.58 |
| 44376.302083333336 | 13.05 |
| 44376.3125 | 13.55 |
| 44376.322916666664 | 13.88 |
| 44376.333333333336 | 13.74 |
| 44376.34375 | 13.23 |
| 44376.354166666664 | 13.91 |
| 44376.364583333336 | 14.43 |
| 44376.375 | 13.96 |
| 44376.385416666664 | 14.89 |
| 44376.395833333336 | 15.21 |
| 44376.40625 | 15.26 |
| 44376.416666666664 | 15.6 |
| 44376.427083333336 | 15.87 |
| 44376.4375 | 17.03 |
| 44376.447916666664 | 17.62 |
| 44376.458333333336 | 17.67 |
| 44376.46875 | 19.22 |
| 44376.479166666664 | 18.49 |
| 44376.489583333336 | 18.17 |
| 44376.5 | 18.48 |
| 44376.510416666664 | 17.27 |
| 44376.520833333336 | 15.92 |
| 44376.53125 | 15.16 |
| 44376.541666666664 | 15.56 |
| 44376.552083333336 | 14.77 |
| 44376.5625 | 14.18 |
| 44376.572916666664 | 13.75 |
| 44376.583333333336 | 13.4 |
| 44376.59375 | 13.75 |
| 44376.604166666664 | 13.14 |
| 44376.614583333336 | 13.52 |
| 44376.625 | 13.88 |
| 44376.635416666664 | 14.17 |
| 44376.645833333336 | 14.08 |
| 44376.65625 | 13.47 |
| 44376.666666666664 | 13.12 |
| 44376.677083333336 | 12.24 |
| 44376.6875 | 12.48 |
| 44376.697916666664 | 12.52 |
| 44376.708333333336 | 12.55 |
| 44376.71875 | 13.53 |
| 44376.729166666664 | 13.28 |
| 44376.739583333336 | 13.79 |
| 44376.75 | 15.78 |
| 44376.760416666664 | 15.17 |
| 44376.770833333336 | 12.9 |
| 44376.78125 | 14.23 |
| 44376.791666666664 | 15.69 |
| 44376.802083333336 | 16.73 |
| 44376.8125 | 16.88 |
| 44376.822916666664 | 16.63 |
| 44376.833333333336 | 16.49 |
| 44376.84375 | 19.74 |
| 44376.854166666664 | 22.01 |
| 44376.864583333336 | 23.09 |
| 44376.875 | 23.37 |
| 44376.885416666664 | 24.9 |
| 44376.895833333336 | 25.14 |
| 44376.90625 | 25.57 |
| 44376.916666666664 | 25.9 |
| 44376.927083333336 | 26.1 |
| 44376.9375 | 24.61 |
| 44376.947916666664 | 23.15 |
| 44376.958333333336 | 21.82 |
| 44376.96875 | 18.98 |
| 44376.979166666664 | 18.62 |
| 44376.989583333336 | 17.04 |
| 44377.0 | 18.31 |
| 44377.010416666664 | 16.85 |
| 44377.020833333336 | 15.57 |
| 44377.03125 | 15.94 |
| 44377.041666666664 | 17.91 |
| 44377.052083333336 | 21.17 |
| 44377.0625 | 23.83 |
| 44377.072916666664 | 25.46 |
| 44377.083333333336 | 30.05 |
| 44377.09375 | 31.33 |
| 44377.104166666664 | 33.17 |
| 44377.114583333336 | 34.59 |
| 44377.125 | 37.07 |
| 44377.135416666664 | 36.71 |
| 44377.145833333336 | 35.76 |
| 44377.15625 | 34.07 |
| 44377.166666666664 | 30.92 |
| 44377.177083333336 | 29.91 |
| 44377.1875 | 28.01 |
| 44377.197916666664 | 25.47 |
| 44377.208333333336 | 22.93 |
| 44377.21875 | 22.36 |
| 44377.229166666664 | 21.01 |
| 44377.239583333336 | 18.95 |
| 44377.25 | 21.39 |
| 44377.260416666664 | 19.46 |
| 44377.270833333336 | 20.73 |
| 44377.28125 | 20.83 |
| 44377.291666666664 | 21.24 |
| 44377.302083333336 | 20.2 |
| 44377.3125 | 21.93 |
| 44377.322916666664 | 19.87 |
| 44377.333333333336 | 21 |
| 44377.34375 | 22.04 |
| 44377.354166666664 | 17.86 |
| 44377.364583333336 | 19.7 |
| 44377.375 | 19.32 |
| 44377.385416666664 | 19.32 |
| 44377.395833333336 | 18.57 |
| 44377.40625 | 17.19 |
| 44377.416666666664 | 18.13 |
| 44377.427083333336 | 18.89 |
| 44377.4375 | 20.72 |
| 44377.447916666664 | 20.27 |
| 44377.458333333336 | 21.35 |
| 44377.46875 | 22.77 |
| 44377.479166666664 | 24.25 |
| 44377.489583333336 | 24.04 |
| 44377.5 | 24.28 |
| 44377.510416666664 | 21.95 |
| 44377.520833333336 | 20.53 |
| 44377.53125 | 21.54 |
| 44377.541666666664 | 20.48 |
| 44377.552083333336 | 20.24 |
| 44377.5625 | 19.42 |
| 44377.572916666664 | 19.7 |
| 44377.583333333336 | 18.95 |
| 44377.59375 | 18.37 |
| 44377.604166666664 | 17.11 |
| 44377.614583333336 | 16.48 |
| 44377.625 | 23.23 |
| 44377.635416666664 | 19.08 |
| 44377.645833333336 | 20.11 |
| 44377.65625 | 18.87 |
| 44377.666666666664 | 21.8 |
| 44377.677083333336 | 19.97 |
| 44377.6875 | 19.13 |
| 44377.697916666664 | 18.3 |
| 44377.708333333336 | 17 |
| 44377.71875 | 17.24 |
| 44377.729166666664 | 16.54 |
| 44377.739583333336 | 17.43 |
| 44377.75 | 16.17 |
| 44377.760416666664 | 12.68 |
| 44377.770833333336 | 11.1 |
| 44377.78125 | 10.54 |
| 44377.791666666664 | 18.85 |
| 44377.802083333336 | 19.22 |
| 44377.8125 | 16.54 |
| 44377.822916666664 | 17.62 |
| 44377.833333333336 | 20.37 |
| 44377.84375 | 22.44 |
| 44377.854166666664 | 21.41 |
| 44377.864583333336 | 20.81 |
| 44377.875 | 19.24 |
| 44377.885416666664 | 18.4 |
| 44377.895833333336 | 18.88 |
| 44377.90625 | 21.98 |
| 44377.916666666664 | 22.79 |
| 44377.927083333336 | 21.82 |
| 44377.9375 | 22.07 |
| 44377.947916666664 | 21.3 |
| 44377.958333333336 | 19.87 |
| 44377.96875 | 20.07 |
| 44377.979166666664 | 18.74 |
| 44377.989583333336 | 18.08 |
| 44378.0 | 17.45 |
| 44378.010416666664 | 17.64 |
| 44378.020833333336 | 17.75 |
| 44378.03125 | 15.27 |
| 44378.041666666664 | 15.06 |
| 44378.052083333336 | 15.55 |
| 44378.0625 | 12.86 |
| 44378.072916666664 | 13.02 |
| 44378.083333333336 | 13.87 |
| 44378.09375 | 17.28 |
| 44378.104166666664 | 16.29 |
| 44378.114583333336 | 15.68 |
| 44378.125 | 19.49 |
| 44378.135416666664 | 18.71 |
| 44378.145833333336 | 20.97 |
| 44378.15625 | 18.95 |